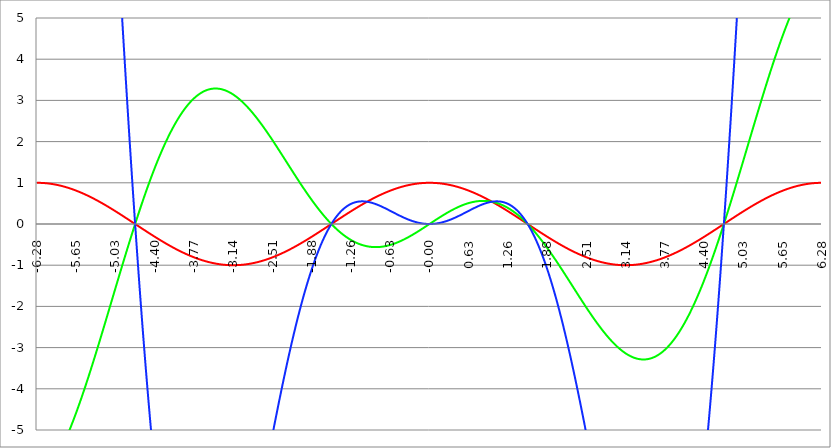
| Category | Series 1 | Series 0 | Series 2 | Series 3 | Series 4 |
|---|---|---|---|---|---|
| -6.283185307179586 | 1 | -6.283 | 39.478 |  |  |
| -6.276902121872407 | 1 | -6.277 | 39.399 |  |  |
| -6.270618936565228 | 1 | -6.27 | 39.318 |  |  |
| -6.264335751258049 | 1 | -6.263 | 39.235 |  |  |
| -6.25805256595087 | 1 | -6.256 | 39.151 |  |  |
| -6.25176938064369 | 1 | -6.249 | 39.065 |  |  |
| -6.245486195336511 | 0.999 | -6.241 | 38.978 |  |  |
| -6.23920301002933 | 0.999 | -6.233 | 38.89 |  |  |
| -6.232919824722153 | 0.999 | -6.225 | 38.8 |  |  |
| -6.226636639414973 | 0.998 | -6.217 | 38.709 |  |  |
| -6.220353454107794 | 0.998 | -6.208 | 38.616 |  |  |
| -6.214070268800615 | 0.998 | -6.199 | 38.522 |  |  |
| -6.207787083493435 | 0.997 | -6.19 | 38.427 |  |  |
| -6.201503898186257 | 0.997 | -6.181 | 38.33 |  |  |
| -6.195220712879077 | 0.996 | -6.171 | 38.232 |  |  |
| -6.188937527571898 | 0.996 | -6.161 | 38.133 |  |  |
| -6.182654342264719 | 0.995 | -6.151 | 38.032 |  |  |
| -6.17637115695754 | 0.994 | -6.141 | 37.93 |  |  |
| -6.170087971650361 | 0.994 | -6.131 | 37.827 |  |  |
| -6.163804786343182 | 0.993 | -6.12 | 37.722 |  |  |
| -6.157521601036002 | 0.992 | -6.109 | 37.616 |  |  |
| -6.151238415728823 | 0.991 | -6.098 | 37.509 |  |  |
| -6.144955230421644 | 0.99 | -6.086 | 37.4 |  |  |
| -6.138672045114464 | 0.99 | -6.075 | 37.29 |  |  |
| -6.132388859807286 | 0.989 | -6.063 | 37.179 |  |  |
| -6.126105674500106 | 0.988 | -6.051 | 37.067 |  |  |
| -6.119822489192927 | 0.987 | -6.038 | 36.954 |  |  |
| -6.113539303885748 | 0.986 | -6.026 | 36.839 |  |  |
| -6.107256118578569 | 0.985 | -6.013 | 36.723 |  |  |
| -6.10097293327139 | 0.983 | -6 | 36.606 |  |  |
| -6.09468974796421 | 0.982 | -5.987 | 36.487 |  |  |
| -6.088406562657031 | 0.981 | -5.973 | 36.368 |  |  |
| -6.082123377349852 | 0.98 | -5.96 | 36.247 |  |  |
| -6.075840192042672 | 0.979 | -5.946 | 36.125 |  |  |
| -6.069557006735494 | 0.977 | -5.932 | 36.002 |  |  |
| -6.063273821428314 | 0.976 | -5.917 | 35.878 |  |  |
| -6.056990636121135 | 0.975 | -5.903 | 35.753 |  |  |
| -6.050707450813956 | 0.973 | -5.888 | 35.626 |  |  |
| -6.044424265506777 | 0.972 | -5.873 | 35.499 |  |  |
| -6.038141080199597 | 0.97 | -5.858 | 35.37 |  |  |
| -6.031857894892418 | 0.969 | -5.842 | 35.24 |  |  |
| -6.025574709585239 | 0.967 | -5.827 | 35.109 |  |  |
| -6.01929152427806 | 0.965 | -5.811 | 34.978 |  |  |
| -6.013008338970881 | 0.964 | -5.795 | 34.845 |  |  |
| -6.006725153663701 | 0.962 | -5.779 | 34.711 |  |  |
| -6.000441968356522 | 0.96 | -5.762 | 34.576 |  |  |
| -5.994158783049343 | 0.959 | -5.746 | 34.44 |  |  |
| -5.987875597742164 | 0.957 | -5.729 | 34.303 |  |  |
| -5.981592412434984 | 0.955 | -5.712 | 34.165 |  |  |
| -5.975309227127805 | 0.953 | -5.694 | 34.025 |  |  |
| -5.969026041820626 | 0.951 | -5.677 | 33.885 |  |  |
| -5.962742856513447 | 0.949 | -5.659 | 33.744 |  |  |
| -5.956459671206268 | 0.947 | -5.641 | 33.602 |  |  |
| -5.950176485899088 | 0.945 | -5.623 | 33.46 |  |  |
| -5.94389330059191 | 0.943 | -5.605 | 33.316 |  |  |
| -5.93761011528473 | 0.941 | -5.587 | 33.171 |  |  |
| -5.931326929977551 | 0.939 | -5.568 | 33.025 |  |  |
| -5.925043744670372 | 0.937 | -5.549 | 32.879 |  |  |
| -5.918760559363193 | 0.934 | -5.53 | 32.731 |  |  |
| -5.912477374056014 | 0.932 | -5.511 | 32.583 |  |  |
| -5.906194188748834 | 0.93 | -5.491 | 32.434 |  |  |
| -5.899911003441655 | 0.927 | -5.472 | 32.283 |  |  |
| -5.893627818134476 | 0.925 | -5.452 | 32.132 |  |  |
| -5.887344632827297 | 0.923 | -5.432 | 31.981 |  |  |
| -5.881061447520117 | 0.92 | -5.412 | 31.828 |  |  |
| -5.874778262212938 | 0.918 | -5.392 | 31.674 |  |  |
| -5.868495076905759 | 0.915 | -5.371 | 31.52 |  |  |
| -5.86221189159858 | 0.913 | -5.35 | 31.365 |  |  |
| -5.855928706291401 | 0.91 | -5.33 | 31.209 |  |  |
| -5.849645520984221 | 0.907 | -5.308 | 31.053 |  |  |
| -5.843362335677042 | 0.905 | -5.287 | 30.895 |  |  |
| -5.837079150369863 | 0.902 | -5.266 | 30.737 |  |  |
| -5.830795965062684 | 0.899 | -5.244 | 30.578 |  |  |
| -5.824512779755505 | 0.897 | -5.222 | 30.419 |  |  |
| -5.818229594448325 | 0.894 | -5.201 | 30.258 |  |  |
| -5.811946409141146 | 0.891 | -5.178 | 30.097 |  |  |
| -5.805663223833967 | 0.888 | -5.156 | 29.935 |  |  |
| -5.799380038526788 | 0.885 | -5.134 | 29.773 |  |  |
| -5.793096853219609 | 0.882 | -5.111 | 29.61 |  |  |
| -5.78681366791243 | 0.879 | -5.088 | 29.446 |  |  |
| -5.780530482605251 | 0.876 | -5.066 | 29.281 |  |  |
| -5.774247297298071 | 0.873 | -5.042 | 29.116 |  |  |
| -5.767964111990892 | 0.87 | -5.019 | 28.951 |  |  |
| -5.761680926683713 | 0.867 | -4.996 | 28.784 |  |  |
| -5.755397741376534 | 0.864 | -4.972 | 28.617 |  |  |
| -5.749114556069355 | 0.861 | -4.949 | 28.45 |  |  |
| -5.742831370762175 | 0.858 | -4.925 | 28.281 |  |  |
| -5.736548185454996 | 0.854 | -4.901 | 28.113 |  |  |
| -5.730265000147816 | 0.851 | -4.876 | 27.943 |  |  |
| -5.723981814840638 | 0.848 | -4.852 | 27.773 |  |  |
| -5.717698629533459 | 0.844 | -4.828 | 27.603 |  |  |
| -5.711415444226279 | 0.841 | -4.803 | 27.432 |  |  |
| -5.7051322589191 | 0.838 | -4.778 | 27.26 |  |  |
| -5.698849073611921 | 0.834 | -4.753 | 27.088 |  |  |
| -5.692565888304742 | 0.831 | -4.728 | 26.916 |  |  |
| -5.686282702997562 | 0.827 | -4.703 | 26.743 |  |  |
| -5.679999517690383 | 0.824 | -4.678 | 26.569 |  |  |
| -5.673716332383204 | 0.82 | -4.652 | 26.395 |  |  |
| -5.667433147076025 | 0.816 | -4.627 | 26.221 |  |  |
| -5.661149961768846 | 0.813 | -4.601 | 26.046 |  |  |
| -5.654866776461667 | 0.809 | -4.575 | 25.87 |  |  |
| -5.648583591154487 | 0.805 | -4.549 | 25.695 |  |  |
| -5.642300405847308 | 0.802 | -4.523 | 25.518 |  |  |
| -5.63601722054013 | 0.798 | -4.496 | 25.342 |  |  |
| -5.62973403523295 | 0.794 | -4.47 | 25.165 |  |  |
| -5.623450849925771 | 0.79 | -4.443 | 24.987 |  |  |
| -5.617167664618591 | 0.786 | -4.417 | 24.809 |  |  |
| -5.610884479311412 | 0.782 | -4.39 | 24.631 |  |  |
| -5.604601294004233 | 0.778 | -4.363 | 24.453 |  |  |
| -5.598318108697054 | 0.775 | -4.336 | 24.274 |  |  |
| -5.592034923389875 | 0.771 | -4.309 | 24.095 |  |  |
| -5.585751738082695 | 0.766 | -4.281 | 23.915 |  |  |
| -5.579468552775516 | 0.762 | -4.254 | 23.735 |  |  |
| -5.573185367468337 | 0.758 | -4.226 | 23.555 |  |  |
| -5.566902182161157 | 0.754 | -4.199 | 23.375 |  |  |
| -5.560618996853979 | 0.75 | -4.171 | 23.194 |  |  |
| -5.5543358115468 | 0.746 | -4.143 | 23.013 |  |  |
| -5.54805262623962 | 0.742 | -4.115 | 22.831 |  |  |
| -5.54176944093244 | 0.738 | -4.087 | 22.65 |  |  |
| -5.535486255625262 | 0.733 | -4.059 | 22.468 |  |  |
| -5.529203070318083 | 0.729 | -4.031 | 22.286 |  |  |
| -5.522919885010904 | 0.725 | -4.002 | 22.104 |  |  |
| -5.516636699703724 | 0.72 | -3.974 | 21.921 |  |  |
| -5.510353514396545 | 0.716 | -3.945 | 21.739 |  |  |
| -5.504070329089366 | 0.712 | -3.916 | 21.556 |  |  |
| -5.497787143782186 | 0.707 | -3.888 | 21.373 |  |  |
| -5.491503958475008 | 0.703 | -3.859 | 21.19 |  |  |
| -5.485220773167828 | 0.698 | -3.83 | 21.006 |  |  |
| -5.47893758786065 | 0.694 | -3.8 | 20.823 |  |  |
| -5.47265440255347 | 0.689 | -3.771 | 20.639 |  |  |
| -5.466371217246291 | 0.685 | -3.742 | 20.455 |  |  |
| -5.460088031939112 | 0.68 | -3.713 | 20.271 |  |  |
| -5.453804846631932 | 0.675 | -3.683 | 20.087 |  |  |
| -5.447521661324753 | 0.671 | -3.654 | 19.903 |  |  |
| -5.441238476017574 | 0.666 | -3.624 | 19.719 |  |  |
| -5.434955290710395 | 0.661 | -3.594 | 19.534 |  |  |
| -5.428672105403215 | 0.657 | -3.564 | 19.35 |  |  |
| -5.422388920096036 | 0.652 | -3.534 | 19.165 |  |  |
| -5.416105734788857 | 0.647 | -3.505 | 18.981 |  |  |
| -5.409822549481678 | 0.642 | -3.474 | 18.796 |  |  |
| -5.403539364174499 | 0.637 | -3.444 | 18.612 |  |  |
| -5.39725617886732 | 0.633 | -3.414 | 18.427 |  |  |
| -5.39097299356014 | 0.628 | -3.384 | 18.242 |  |  |
| -5.384689808252961 | 0.623 | -3.354 | 18.058 |  |  |
| -5.378406622945782 | 0.618 | -3.323 | 17.873 |  |  |
| -5.372123437638603 | 0.613 | -3.293 | 17.688 |  |  |
| -5.365840252331424 | 0.608 | -3.262 | 17.504 |  |  |
| -5.359557067024244 | 0.603 | -3.231 | 17.319 |  |  |
| -5.353273881717065 | 0.598 | -3.201 | 17.134 |  |  |
| -5.346990696409886 | 0.593 | -3.17 | 16.95 |  |  |
| -5.340707511102707 | 0.588 | -3.139 | 16.765 |  |  |
| -5.334424325795528 | 0.583 | -3.108 | 16.581 |  |  |
| -5.328141140488348 | 0.578 | -3.077 | 16.397 |  |  |
| -5.32185795518117 | 0.572 | -3.046 | 16.213 |  |  |
| -5.31557476987399 | 0.567 | -3.015 | 16.028 |  |  |
| -5.30929158456681 | 0.562 | -2.984 | 15.844 |  |  |
| -5.303008399259631 | 0.557 | -2.953 | 15.66 |  |  |
| -5.296725213952453 | 0.552 | -2.922 | 15.477 |  |  |
| -5.290442028645273 | 0.546 | -2.891 | 15.293 |  |  |
| -5.284158843338094 | 0.541 | -2.859 | 15.109 |  |  |
| -5.277875658030915 | 0.536 | -2.828 | 14.926 |  |  |
| -5.271592472723735 | 0.531 | -2.797 | 14.743 |  |  |
| -5.265309287416557 | 0.525 | -2.765 | 14.56 |  |  |
| -5.259026102109377 | 0.52 | -2.734 | 14.377 |  |  |
| -5.252742916802198 | 0.514 | -2.702 | 14.194 |  |  |
| -5.246459731495019 | 0.509 | -2.671 | 14.012 |  |  |
| -5.24017654618784 | 0.504 | -2.639 | 13.829 |  |  |
| -5.23389336088066 | 0.498 | -2.607 | 13.647 |  |  |
| -5.227610175573481 | 0.493 | -2.576 | 13.465 |  |  |
| -5.221326990266302 | 0.487 | -2.544 | 13.284 |  |  |
| -5.215043804959122 | 0.482 | -2.512 | 13.102 |  |  |
| -5.208760619651944 | 0.476 | -2.481 | 12.921 |  |  |
| -5.202477434344764 | 0.471 | -2.449 | 12.74 |  |  |
| -5.196194249037585 | 0.465 | -2.417 | 12.559 |  |  |
| -5.189911063730406 | 0.46 | -2.385 | 12.379 |  |  |
| -5.183627878423227 | 0.454 | -2.353 | 12.199 |  |  |
| -5.177344693116048 | 0.448 | -2.321 | 12.019 |  |  |
| -5.171061507808868 | 0.443 | -2.29 | 11.839 |  |  |
| -5.164778322501689 | 0.437 | -2.258 | 11.66 |  |  |
| -5.15849513719451 | 0.431 | -2.226 | 11.481 |  |  |
| -5.152211951887331 | 0.426 | -2.194 | 11.302 |  |  |
| -5.145928766580152 | 0.42 | -2.162 | 11.124 |  |  |
| -5.139645581272972 | 0.414 | -2.13 | 10.946 |  |  |
| -5.133362395965793 | 0.409 | -2.098 | 10.768 |  |  |
| -5.127079210658614 | 0.403 | -2.066 | 10.591 |  |  |
| -5.120796025351435 | 0.397 | -2.034 | 10.414 |  |  |
| -5.114512840044256 | 0.391 | -2.002 | 10.238 |  |  |
| -5.108229654737076 | 0.386 | -1.97 | 10.061 |  |  |
| -5.101946469429897 | 0.38 | -1.938 | 9.886 |  |  |
| -5.095663284122718 | 0.374 | -1.906 | 9.71 |  |  |
| -5.08938009881554 | 0.368 | -1.874 | 9.535 |  |  |
| -5.08309691350836 | 0.362 | -1.841 | 9.36 |  |  |
| -5.07681372820118 | 0.356 | -1.809 | 9.186 |  |  |
| -5.070530542894002 | 0.351 | -1.777 | 9.012 |  |  |
| -5.064247357586822 | 0.345 | -1.745 | 8.839 |  |  |
| -5.057964172279643 | 0.339 | -1.713 | 8.666 |  |  |
| -5.051680986972464 | 0.333 | -1.681 | 8.493 |  |  |
| -5.045397801665285 | 0.327 | -1.649 | 8.321 |  |  |
| -5.039114616358106 | 0.321 | -1.617 | 8.15 |  |  |
| -5.032831431050926 | 0.315 | -1.585 | 7.978 |  |  |
| -5.026548245743747 | 0.309 | -1.553 | 7.808 |  |  |
| -5.020265060436568 | 0.303 | -1.521 | 7.637 |  |  |
| -5.013981875129389 | 0.297 | -1.489 | 7.468 |  |  |
| -5.00769868982221 | 0.291 | -1.457 | 7.298 |  |  |
| -5.00141550451503 | 0.285 | -1.425 | 7.13 |  |  |
| -4.995132319207851 | 0.279 | -1.394 | 6.961 |  |  |
| -4.98884913390067 | 0.273 | -1.362 | 6.793 |  |  |
| -4.982565948593493 | 0.267 | -1.33 | 6.626 |  |  |
| -4.976282763286313 | 0.261 | -1.298 | 6.459 |  |  |
| -4.969999577979134 | 0.255 | -1.266 | 6.293 |  |  |
| -4.963716392671955 | 0.249 | -1.234 | 6.127 |  |  |
| -4.957433207364776 | 0.243 | -1.203 | 5.962 |  |  |
| -4.951150022057597 | 0.236 | -1.171 | 5.798 |  |  |
| -4.944866836750418 | 0.23 | -1.139 | 5.633 |  |  |
| -4.938583651443238 | 0.224 | -1.108 | 5.47 |  |  |
| -4.932300466136059 | 0.218 | -1.076 | 5.307 |  |  |
| -4.92601728082888 | 0.212 | -1.044 | 5.144 |  |  |
| -4.9197340955217 | 0.206 | -1.013 | 4.983 |  |  |
| -4.913450910214521 | 0.2 | -0.981 | 4.821 |  |  |
| -4.907167724907342 | 0.194 | -0.95 | 4.661 |  |  |
| -4.900884539600163 | 0.187 | -0.918 | 4.501 |  |  |
| -4.894601354292984 | 0.181 | -0.887 | 4.341 |  |  |
| -4.888318168985805 | 0.175 | -0.856 | 4.182 |  |  |
| -4.882034983678625 | 0.169 | -0.824 | 4.024 |  |  |
| -4.875751798371446 | 0.163 | -0.793 | 3.866 |  |  |
| -4.869468613064267 | 0.156 | -0.762 | 3.709 |  |  |
| -4.863185427757088 | 0.15 | -0.731 | 3.553 |  |  |
| -4.856902242449909 | 0.144 | -0.699 | 3.397 |  |  |
| -4.85061905714273 | 0.138 | -0.668 | 3.242 |  |  |
| -4.84433587183555 | 0.132 | -0.637 | 3.087 |  |  |
| -4.838052686528371 | 0.125 | -0.606 | 2.934 |  |  |
| -4.831769501221192 | 0.119 | -0.575 | 2.78 |  |  |
| -4.825486315914013 | 0.113 | -0.545 | 2.628 |  |  |
| -4.819203130606833 | 0.107 | -0.514 | 2.476 |  |  |
| -4.812919945299654 | 0.1 | -0.483 | 2.325 |  |  |
| -4.806636759992475 | 0.094 | -0.452 | 2.174 |  |  |
| -4.800353574685296 | 0.088 | -0.422 | 2.024 |  |  |
| -4.794070389378117 | 0.082 | -0.391 | 1.875 |  |  |
| -4.787787204070938 | 0.075 | -0.361 | 1.727 |  |  |
| -4.781504018763758 | 0.069 | -0.33 | 1.579 |  |  |
| -4.77522083345658 | 0.063 | -0.3 | 1.432 |  |  |
| -4.7689376481494 | 0.057 | -0.27 | 1.285 |  |  |
| -4.762654462842221 | 0.05 | -0.239 | 1.14 |  |  |
| -4.756371277535042 | 0.044 | -0.209 | 0.995 |  |  |
| -4.750088092227862 | 0.038 | -0.179 | 0.85 |  |  |
| -4.743804906920683 | 0.031 | -0.149 | 0.707 |  |  |
| -4.737521721613504 | 0.025 | -0.119 | 0.564 |  |  |
| -4.731238536306324 | 0.019 | -0.089 | 0.422 |  |  |
| -4.724955350999146 | 0.013 | -0.059 | 0.281 |  |  |
| -4.718672165691966 | 0.006 | -0.03 | 0.14 |  |  |
| -4.712388980384787 | 0 | 0 | 0 |  |  |
| -4.706105795077608 | -0.006 | 0.03 | -0.139 |  |  |
| -4.699822609770429 | -0.013 | 0.059 | -0.278 |  |  |
| -4.69353942446325 | -0.019 | 0.088 | -0.415 |  |  |
| -4.68725623915607 | -0.025 | 0.118 | -0.552 |  |  |
| -4.680973053848891 | -0.031 | 0.147 | -0.688 |  |  |
| -4.674689868541712 | -0.038 | 0.176 | -0.824 |  |  |
| -4.668406683234533 | -0.044 | 0.205 | -0.958 |  |  |
| -4.662123497927354 | -0.05 | 0.234 | -1.092 |  |  |
| -4.655840312620174 | -0.057 | 0.263 | -1.225 |  |  |
| -4.649557127312995 | -0.063 | 0.292 | -1.357 |  |  |
| -4.643273942005816 | -0.069 | 0.321 | -1.489 |  |  |
| -4.636990756698637 | -0.075 | 0.349 | -1.62 |  |  |
| -4.630707571391458 | -0.082 | 0.378 | -1.75 |  |  |
| -4.624424386084279 | -0.088 | 0.406 | -1.879 |  |  |
| -4.618141200777099 | -0.094 | 0.435 | -2.007 |  |  |
| -4.61185801546992 | -0.1 | 0.463 | -2.135 |  |  |
| -4.605574830162741 | -0.107 | 0.491 | -2.261 |  |  |
| -4.599291644855561 | -0.113 | 0.519 | -2.387 |  |  |
| -4.593008459548383 | -0.119 | 0.547 | -2.512 |  |  |
| -4.586725274241203 | -0.125 | 0.575 | -2.637 |  |  |
| -4.580442088934024 | -0.132 | 0.603 | -2.76 |  |  |
| -4.574158903626845 | -0.138 | 0.63 | -2.883 |  |  |
| -4.567875718319666 | -0.144 | 0.658 | -3.005 |  |  |
| -4.561592533012487 | -0.15 | 0.685 | -3.126 |  |  |
| -4.555309347705307 | -0.156 | 0.713 | -3.246 |  |  |
| -4.549026162398128 | -0.163 | 0.74 | -3.366 |  |  |
| -4.542742977090949 | -0.169 | 0.767 | -3.484 |  |  |
| -4.53645979178377 | -0.175 | 0.794 | -3.602 |  |  |
| -4.530176606476591 | -0.181 | 0.821 | -3.719 |  |  |
| -4.523893421169412 | -0.187 | 0.848 | -3.835 |  |  |
| -4.517610235862232 | -0.194 | 0.874 | -3.95 |  |  |
| -4.511327050555053 | -0.2 | 0.901 | -4.065 |  |  |
| -4.505043865247874 | -0.206 | 0.927 | -4.178 |  |  |
| -4.498760679940694 | -0.212 | 0.954 | -4.291 |  |  |
| -4.492477494633515 | -0.218 | 0.98 | -4.403 |  |  |
| -4.486194309326336 | -0.224 | 1.006 | -4.514 |  |  |
| -4.479911124019157 | -0.23 | 1.032 | -4.624 |  |  |
| -4.473627938711977 | -0.236 | 1.058 | -4.733 |  |  |
| -4.467344753404799 | -0.243 | 1.084 | -4.842 |  |  |
| -4.46106156809762 | -0.249 | 1.109 | -4.949 |  |  |
| -4.45477838279044 | -0.255 | 1.135 | -5.056 |  |  |
| -4.44849519748326 | -0.261 | 1.16 | -5.162 |  |  |
| -4.442212012176082 | -0.267 | 1.186 | -5.267 |  |  |
| -4.435928826868903 | -0.273 | 1.211 | -5.371 |  |  |
| -4.429645641561723 | -0.279 | 1.236 | -5.474 |  |  |
| -4.423362456254544 | -0.285 | 1.261 | -5.577 |  |  |
| -4.417079270947365 | -0.291 | 1.286 | -5.678 |  |  |
| -4.410796085640185 | -0.297 | 1.31 | -5.779 |  |  |
| -4.404512900333007 | -0.303 | 1.335 | -5.879 |  |  |
| -4.398229715025827 | -0.309 | 1.359 | -5.978 |  |  |
| -4.391946529718648 | -0.315 | 1.383 | -6.076 |  |  |
| -4.38566334441147 | -0.321 | 1.408 | -6.173 |  |  |
| -4.37938015910429 | -0.327 | 1.432 | -6.269 |  |  |
| -4.373096973797111 | -0.333 | 1.455 | -6.365 |  |  |
| -4.366813788489932 | -0.339 | 1.479 | -6.459 |  |  |
| -4.360530603182752 | -0.345 | 1.503 | -6.553 |  |  |
| -4.354247417875573 | -0.351 | 1.526 | -6.646 |  |  |
| -4.347964232568394 | -0.356 | 1.55 | -6.738 |  |  |
| -4.341681047261215 | -0.362 | 1.573 | -6.829 |  |  |
| -4.335397861954035 | -0.368 | 1.596 | -6.919 |  |  |
| -4.329114676646856 | -0.374 | 1.619 | -7.008 |  |  |
| -4.322831491339677 | -0.38 | 1.642 | -7.097 |  |  |
| -4.316548306032498 | -0.386 | 1.664 | -7.184 |  |  |
| -4.310265120725319 | -0.391 | 1.687 | -7.271 |  |  |
| -4.30398193541814 | -0.397 | 1.709 | -7.357 |  |  |
| -4.29769875011096 | -0.403 | 1.732 | -7.442 |  |  |
| -4.291415564803781 | -0.409 | 1.754 | -7.526 |  |  |
| -4.285132379496602 | -0.414 | 1.776 | -7.609 |  |  |
| -4.278849194189422 | -0.42 | 1.797 | -7.691 |  |  |
| -4.272566008882244 | -0.426 | 1.819 | -7.773 |  |  |
| -4.266282823575064 | -0.431 | 1.841 | -7.853 |  |  |
| -4.259999638267885 | -0.437 | 1.862 | -7.933 |  |  |
| -4.253716452960706 | -0.443 | 1.883 | -8.011 |  |  |
| -4.247433267653527 | -0.448 | 1.904 | -8.089 |  |  |
| -4.241150082346347 | -0.454 | 1.925 | -8.166 |  |  |
| -4.234866897039168 | -0.46 | 1.946 | -8.242 |  |  |
| -4.228583711731989 | -0.465 | 1.967 | -8.317 |  |  |
| -4.22230052642481 | -0.471 | 1.987 | -8.392 |  |  |
| -4.216017341117631 | -0.476 | 2.008 | -8.465 |  |  |
| -4.209734155810452 | -0.482 | 2.028 | -8.538 |  |  |
| -4.203450970503273 | -0.487 | 2.048 | -8.609 |  |  |
| -4.197167785196093 | -0.493 | 2.068 | -8.68 |  |  |
| -4.190884599888914 | -0.498 | 2.088 | -8.75 |  |  |
| -4.184601414581734 | -0.504 | 2.107 | -8.819 |  |  |
| -4.178318229274556 | -0.509 | 2.127 | -8.887 |  |  |
| -4.172035043967377 | -0.514 | 2.146 | -8.954 |  |  |
| -4.165751858660197 | -0.52 | 2.165 | -9.021 |  |  |
| -4.159468673353018 | -0.525 | 2.184 | -9.086 |  |  |
| -4.153185488045839 | -0.531 | 2.203 | -9.151 |  |  |
| -4.14690230273866 | -0.536 | 2.222 | -9.215 |  |  |
| -4.140619117431481 | -0.541 | 2.241 | -9.277 |  |  |
| -4.134335932124301 | -0.546 | 2.259 | -9.339 |  |  |
| -4.128052746817122 | -0.552 | 2.277 | -9.4 |  |  |
| -4.121769561509943 | -0.557 | 2.295 | -9.461 |  |  |
| -4.115486376202764 | -0.562 | 2.313 | -9.52 |  |  |
| -4.109203190895584 | -0.567 | 2.331 | -9.579 |  |  |
| -4.102920005588405 | -0.572 | 2.349 | -9.636 |  |  |
| -4.096636820281226 | -0.578 | 2.366 | -9.693 |  |  |
| -4.090353634974047 | -0.583 | 2.383 | -9.749 |  |  |
| -4.084070449666868 | -0.588 | 2.401 | -9.804 |  |  |
| -4.077787264359689 | -0.593 | 2.418 | -9.858 |  |  |
| -4.071504079052509 | -0.598 | 2.434 | -9.912 |  |  |
| -4.06522089374533 | -0.603 | 2.451 | -9.964 |  |  |
| -4.058937708438151 | -0.608 | 2.468 | -10.016 |  |  |
| -4.052654523130972 | -0.613 | 2.484 | -10.066 |  |  |
| -4.046371337823793 | -0.618 | 2.5 | -10.116 |  |  |
| -4.040088152516613 | -0.623 | 2.516 | -10.165 |  |  |
| -4.033804967209434 | -0.628 | 2.532 | -10.214 |  |  |
| -4.027521781902255 | -0.633 | 2.548 | -10.261 |  |  |
| -4.021238596595076 | -0.637 | 2.563 | -10.307 |  |  |
| -4.014955411287897 | -0.642 | 2.579 | -10.353 |  |  |
| -4.008672225980717 | -0.647 | 2.594 | -10.398 |  |  |
| -4.002389040673538 | -0.652 | 2.609 | -10.442 |  |  |
| -3.996105855366359 | -0.657 | 2.624 | -10.485 |  |  |
| -3.989822670059179 | -0.661 | 2.639 | -10.527 |  |  |
| -3.983539484752 | -0.666 | 2.653 | -10.569 |  |  |
| -3.97725629944482 | -0.671 | 2.667 | -10.609 |  |  |
| -3.97097311413764 | -0.675 | 2.682 | -10.649 |  |  |
| -3.96468992883046 | -0.68 | 2.696 | -10.688 |  |  |
| -3.958406743523281 | -0.685 | 2.71 | -10.726 |  |  |
| -3.952123558216101 | -0.689 | 2.723 | -10.763 |  |  |
| -3.945840372908922 | -0.694 | 2.737 | -10.8 |  |  |
| -3.939557187601742 | -0.698 | 2.75 | -10.836 |  |  |
| -3.933274002294562 | -0.703 | 2.764 | -10.87 |  |  |
| -3.926990816987382 | -0.707 | 2.777 | -10.904 |  |  |
| -3.920707631680203 | -0.712 | 2.79 | -10.938 |  |  |
| -3.914424446373023 | -0.716 | 2.802 | -10.97 |  |  |
| -3.908141261065844 | -0.72 | 2.815 | -11.002 |  |  |
| -3.901858075758664 | -0.725 | 2.827 | -11.032 |  |  |
| -3.895574890451484 | -0.729 | 2.84 | -11.062 |  |  |
| -3.889291705144305 | -0.733 | 2.852 | -11.092 |  |  |
| -3.883008519837125 | -0.738 | 2.864 | -11.12 |  |  |
| -3.876725334529945 | -0.742 | 2.876 | -11.148 |  |  |
| -3.870442149222766 | -0.746 | 2.887 | -11.174 |  |  |
| -3.864158963915586 | -0.75 | 2.899 | -11.2 |  |  |
| -3.857875778608407 | -0.754 | 2.91 | -11.226 |  |  |
| -3.851592593301227 | -0.758 | 2.921 | -11.25 |  |  |
| -3.845309407994047 | -0.762 | 2.932 | -11.274 |  |  |
| -3.839026222686868 | -0.766 | 2.943 | -11.297 |  |  |
| -3.832743037379688 | -0.771 | 2.953 | -11.319 |  |  |
| -3.826459852072508 | -0.775 | 2.964 | -11.34 |  |  |
| -3.820176666765329 | -0.778 | 2.974 | -11.361 |  |  |
| -3.813893481458149 | -0.782 | 2.984 | -11.38 |  |  |
| -3.807610296150969 | -0.786 | 2.994 | -11.4 |  |  |
| -3.80132711084379 | -0.79 | 3.004 | -11.418 |  |  |
| -3.79504392553661 | -0.794 | 3.013 | -11.435 |  |  |
| -3.78876074022943 | -0.798 | 3.023 | -11.452 |  |  |
| -3.782477554922251 | -0.802 | 3.032 | -11.468 |  |  |
| -3.776194369615071 | -0.805 | 3.041 | -11.483 |  |  |
| -3.769911184307892 | -0.809 | 3.05 | -11.498 |  |  |
| -3.763627999000712 | -0.813 | 3.059 | -11.512 |  |  |
| -3.757344813693532 | -0.816 | 3.067 | -11.525 |  |  |
| -3.751061628386352 | -0.82 | 3.076 | -11.537 |  |  |
| -3.744778443079173 | -0.824 | 3.084 | -11.549 |  |  |
| -3.738495257771993 | -0.827 | 3.092 | -11.56 |  |  |
| -3.732212072464814 | -0.831 | 3.1 | -11.57 |  |  |
| -3.725928887157634 | -0.834 | 3.108 | -11.579 |  |  |
| -3.719645701850454 | -0.838 | 3.115 | -11.588 |  |  |
| -3.713362516543275 | -0.841 | 3.123 | -11.596 |  |  |
| -3.707079331236095 | -0.844 | 3.13 | -11.603 |  |  |
| -3.700796145928915 | -0.848 | 3.137 | -11.61 |  |  |
| -3.694512960621736 | -0.851 | 3.144 | -11.616 |  |  |
| -3.688229775314556 | -0.854 | 3.151 | -11.621 |  |  |
| -3.681946590007376 | -0.858 | 3.157 | -11.625 |  |  |
| -3.675663404700197 | -0.861 | 3.164 | -11.629 |  |  |
| -3.669380219393017 | -0.864 | 3.17 | -11.632 |  |  |
| -3.663097034085838 | -0.867 | 3.176 | -11.635 |  |  |
| -3.656813848778658 | -0.87 | 3.182 | -11.636 |  |  |
| -3.650530663471478 | -0.873 | 3.188 | -11.637 |  |  |
| -3.644247478164299 | -0.876 | 3.193 | -11.638 |  |  |
| -3.63796429285712 | -0.879 | 3.199 | -11.638 |  |  |
| -3.631681107549939 | -0.882 | 3.204 | -11.637 |  |  |
| -3.62539792224276 | -0.885 | 3.209 | -11.635 |  |  |
| -3.61911473693558 | -0.888 | 3.214 | -11.633 |  |  |
| -3.612831551628401 | -0.891 | 3.219 | -11.63 |  |  |
| -3.606548366321221 | -0.894 | 3.224 | -11.626 |  |  |
| -3.600265181014041 | -0.897 | 3.228 | -11.622 |  |  |
| -3.593981995706862 | -0.899 | 3.232 | -11.617 |  |  |
| -3.587698810399682 | -0.902 | 3.237 | -11.612 |  |  |
| -3.581415625092502 | -0.905 | 3.241 | -11.606 |  |  |
| -3.575132439785323 | -0.907 | 3.244 | -11.599 |  |  |
| -3.568849254478143 | -0.91 | 3.248 | -11.592 |  |  |
| -3.562566069170964 | -0.913 | 3.252 | -11.584 |  |  |
| -3.556282883863784 | -0.915 | 3.255 | -11.575 |  |  |
| -3.549999698556604 | -0.918 | 3.258 | -11.566 |  |  |
| -3.543716513249425 | -0.92 | 3.261 | -11.556 |  |  |
| -3.537433327942245 | -0.923 | 3.264 | -11.546 |  |  |
| -3.531150142635065 | -0.925 | 3.267 | -11.535 |  |  |
| -3.524866957327886 | -0.927 | 3.269 | -11.523 |  |  |
| -3.518583772020706 | -0.93 | 3.271 | -11.511 |  |  |
| -3.512300586713526 | -0.932 | 3.274 | -11.498 |  |  |
| -3.506017401406347 | -0.934 | 3.276 | -11.485 |  |  |
| -3.499734216099167 | -0.937 | 3.278 | -11.471 |  |  |
| -3.493451030791987 | -0.939 | 3.279 | -11.456 |  |  |
| -3.487167845484808 | -0.941 | 3.281 | -11.441 |  |  |
| -3.480884660177628 | -0.943 | 3.282 | -11.426 |  |  |
| -3.474601474870449 | -0.945 | 3.284 | -11.41 |  |  |
| -3.468318289563269 | -0.947 | 3.285 | -11.393 |  |  |
| -3.462035104256089 | -0.949 | 3.286 | -11.376 |  |  |
| -3.45575191894891 | -0.951 | 3.287 | -11.358 |  |  |
| -3.44946873364173 | -0.953 | 3.287 | -11.339 |  |  |
| -3.44318554833455 | -0.955 | 3.288 | -11.32 |  |  |
| -3.436902363027371 | -0.957 | 3.288 | -11.301 |  |  |
| -3.430619177720191 | -0.959 | 3.288 | -11.281 |  |  |
| -3.424335992413011 | -0.96 | 3.288 | -11.26 |  |  |
| -3.418052807105832 | -0.962 | 3.288 | -11.239 |  |  |
| -3.411769621798652 | -0.964 | 3.288 | -11.218 |  |  |
| -3.405486436491473 | -0.965 | 3.288 | -11.196 |  |  |
| -3.399203251184293 | -0.967 | 3.287 | -11.173 |  |  |
| -3.392920065877113 | -0.969 | 3.286 | -11.15 |  |  |
| -3.386636880569934 | -0.97 | 3.285 | -11.127 |  |  |
| -3.380353695262754 | -0.972 | 3.284 | -11.103 |  |  |
| -3.374070509955574 | -0.973 | 3.283 | -11.078 |  |  |
| -3.367787324648395 | -0.975 | 3.282 | -11.053 |  |  |
| -3.361504139341215 | -0.976 | 3.281 | -11.028 |  |  |
| -3.355220954034035 | -0.977 | 3.279 | -11.002 |  |  |
| -3.348937768726855 | -0.979 | 3.277 | -10.975 |  |  |
| -3.342654583419676 | -0.98 | 3.275 | -10.948 |  |  |
| -3.336371398112496 | -0.981 | 3.273 | -10.921 |  |  |
| -3.330088212805317 | -0.982 | 3.271 | -10.893 |  |  |
| -3.323805027498137 | -0.983 | 3.269 | -10.865 |  |  |
| -3.317521842190957 | -0.985 | 3.266 | -10.836 |  |  |
| -3.311238656883778 | -0.986 | 3.264 | -10.807 |  |  |
| -3.304955471576598 | -0.987 | 3.261 | -10.777 |  |  |
| -3.298672286269419 | -0.988 | 3.258 | -10.747 |  |  |
| -3.292389100962239 | -0.989 | 3.255 | -10.717 |  |  |
| -3.286105915655059 | -0.99 | 3.252 | -10.686 |  |  |
| -3.27982273034788 | -0.99 | 3.249 | -10.655 |  |  |
| -3.2735395450407 | -0.991 | 3.245 | -10.623 |  |  |
| -3.26725635973352 | -0.992 | 3.241 | -10.591 |  |  |
| -3.260973174426341 | -0.993 | 3.238 | -10.558 |  |  |
| -3.254689989119161 | -0.994 | 3.234 | -10.525 |  |  |
| -3.248406803811982 | -0.994 | 3.23 | -10.492 |  |  |
| -3.242123618504802 | -0.995 | 3.226 | -10.458 |  |  |
| -3.235840433197622 | -0.996 | 3.221 | -10.424 |  |  |
| -3.229557247890442 | -0.996 | 3.217 | -10.39 |  |  |
| -3.223274062583263 | -0.997 | 3.213 | -10.355 |  |  |
| -3.216990877276083 | -0.997 | 3.208 | -10.32 |  |  |
| -3.210707691968904 | -0.998 | 3.203 | -10.284 |  |  |
| -3.204424506661724 | -0.998 | 3.198 | -10.248 |  |  |
| -3.198141321354544 | -0.998 | 3.193 | -10.212 |  |  |
| -3.191858136047365 | -0.999 | 3.188 | -10.175 |  |  |
| -3.185574950740185 | -0.999 | 3.182 | -10.138 |  |  |
| -3.179291765433005 | -0.999 | 3.177 | -10.101 |  |  |
| -3.173008580125826 | -1 | 3.171 | -10.063 |  |  |
| -3.166725394818646 | -1 | 3.166 | -10.025 |  |  |
| -3.160442209511467 | -1 | 3.16 | -9.987 |  |  |
| -3.154159024204287 | -1 | 3.154 | -9.948 |  |  |
| -3.147875838897107 | -1 | 3.148 | -9.909 |  |  |
| -3.141592653589928 | -1 | 3.142 | -9.87 |  |  |
| -3.135309468282748 | -1 | 3.135 | -9.83 |  |  |
| -3.129026282975568 | -1 | 3.129 | -9.79 |  |  |
| -3.122743097668389 | -1 | 3.122 | -9.75 |  |  |
| -3.116459912361209 | -1 | 3.115 | -9.709 |  |  |
| -3.110176727054029 | -1 | 3.109 | -9.668 |  |  |
| -3.10389354174685 | -0.999 | 3.102 | -9.627 |  |  |
| -3.09761035643967 | -0.999 | 3.095 | -9.586 |  |  |
| -3.09132717113249 | -0.999 | 3.087 | -9.544 |  |  |
| -3.085043985825311 | -0.998 | 3.08 | -9.502 |  |  |
| -3.078760800518131 | -0.998 | 3.073 | -9.46 |  |  |
| -3.072477615210952 | -0.998 | 3.065 | -9.418 |  |  |
| -3.066194429903772 | -0.997 | 3.057 | -9.375 |  |  |
| -3.059911244596592 | -0.997 | 3.05 | -9.332 |  |  |
| -3.053628059289413 | -0.996 | 3.042 | -9.289 |  |  |
| -3.047344873982233 | -0.996 | 3.034 | -9.245 |  |  |
| -3.041061688675053 | -0.995 | 3.026 | -9.201 |  |  |
| -3.034778503367874 | -0.994 | 3.017 | -9.157 |  |  |
| -3.028495318060694 | -0.994 | 3.009 | -9.113 |  |  |
| -3.022212132753515 | -0.993 | 3.001 | -9.069 |  |  |
| -3.015928947446335 | -0.992 | 2.992 | -9.024 |  |  |
| -3.009645762139155 | -0.991 | 2.983 | -8.979 |  |  |
| -3.003362576831975 | -0.99 | 2.975 | -8.934 |  |  |
| -2.997079391524796 | -0.99 | 2.966 | -8.889 |  |  |
| -2.990796206217616 | -0.989 | 2.957 | -8.843 |  |  |
| -2.984513020910436 | -0.988 | 2.948 | -8.798 |  |  |
| -2.978229835603257 | -0.987 | 2.939 | -8.752 |  |  |
| -2.971946650296077 | -0.986 | 2.929 | -8.706 |  |  |
| -2.965663464988898 | -0.985 | 2.92 | -8.659 |  |  |
| -2.959380279681718 | -0.983 | 2.91 | -8.613 |  |  |
| -2.953097094374538 | -0.982 | 2.901 | -8.566 |  |  |
| -2.946813909067359 | -0.981 | 2.891 | -8.52 |  |  |
| -2.94053072376018 | -0.98 | 2.881 | -8.473 |  |  |
| -2.934247538453 | -0.979 | 2.871 | -8.425 |  |  |
| -2.92796435314582 | -0.977 | 2.861 | -8.378 |  |  |
| -2.92168116783864 | -0.976 | 2.851 | -8.331 |  |  |
| -2.915397982531461 | -0.975 | 2.841 | -8.283 |  |  |
| -2.909114797224281 | -0.973 | 2.831 | -8.235 |  |  |
| -2.902831611917101 | -0.972 | 2.82 | -8.187 |  |  |
| -2.896548426609922 | -0.97 | 2.81 | -8.139 |  |  |
| -2.890265241302742 | -0.969 | 2.799 | -8.091 |  |  |
| -2.883982055995562 | -0.967 | 2.789 | -8.043 |  |  |
| -2.877698870688383 | -0.965 | 2.778 | -7.994 |  |  |
| -2.871415685381203 | -0.964 | 2.767 | -7.946 |  |  |
| -2.865132500074023 | -0.962 | 2.756 | -7.897 |  |  |
| -2.858849314766844 | -0.96 | 2.745 | -7.848 |  |  |
| -2.852566129459664 | -0.959 | 2.734 | -7.8 |  |  |
| -2.846282944152485 | -0.957 | 2.723 | -7.751 |  |  |
| -2.839999758845305 | -0.955 | 2.712 | -7.702 |  |  |
| -2.833716573538125 | -0.953 | 2.7 | -7.652 |  |  |
| -2.827433388230946 | -0.951 | 2.689 | -7.603 |  |  |
| -2.821150202923766 | -0.949 | 2.678 | -7.554 |  |  |
| -2.814867017616586 | -0.947 | 2.666 | -7.504 |  |  |
| -2.808583832309407 | -0.945 | 2.654 | -7.455 |  |  |
| -2.802300647002227 | -0.943 | 2.643 | -7.405 |  |  |
| -2.796017461695047 | -0.941 | 2.631 | -7.356 |  |  |
| -2.789734276387867 | -0.939 | 2.619 | -7.306 |  |  |
| -2.783451091080688 | -0.937 | 2.607 | -7.256 |  |  |
| -2.777167905773509 | -0.934 | 2.595 | -7.206 |  |  |
| -2.770884720466329 | -0.932 | 2.583 | -7.156 |  |  |
| -2.764601535159149 | -0.93 | 2.57 | -7.106 |  |  |
| -2.75831834985197 | -0.927 | 2.558 | -7.056 |  |  |
| -2.75203516454479 | -0.925 | 2.546 | -7.006 |  |  |
| -2.74575197923761 | -0.923 | 2.533 | -6.956 |  |  |
| -2.739468793930431 | -0.92 | 2.521 | -6.906 |  |  |
| -2.733185608623251 | -0.918 | 2.508 | -6.856 |  |  |
| -2.726902423316071 | -0.915 | 2.496 | -6.806 |  |  |
| -2.720619238008892 | -0.913 | 2.483 | -6.756 |  |  |
| -2.714336052701712 | -0.91 | 2.47 | -6.705 |  |  |
| -2.708052867394532 | -0.907 | 2.458 | -6.655 |  |  |
| -2.701769682087352 | -0.905 | 2.445 | -6.605 |  |  |
| -2.695486496780173 | -0.902 | 2.432 | -6.555 |  |  |
| -2.689203311472993 | -0.899 | 2.419 | -6.504 |  |  |
| -2.682920126165814 | -0.897 | 2.406 | -6.454 |  |  |
| -2.676636940858634 | -0.894 | 2.392 | -6.404 |  |  |
| -2.670353755551454 | -0.891 | 2.379 | -6.354 |  |  |
| -2.664070570244275 | -0.888 | 2.366 | -6.303 |  |  |
| -2.657787384937095 | -0.885 | 2.353 | -6.253 |  |  |
| -2.651504199629916 | -0.882 | 2.339 | -6.203 |  |  |
| -2.645221014322736 | -0.879 | 2.326 | -6.153 |  |  |
| -2.638937829015556 | -0.876 | 2.313 | -6.103 |  |  |
| -2.632654643708377 | -0.873 | 2.299 | -6.052 |  |  |
| -2.626371458401197 | -0.87 | 2.285 | -6.002 |  |  |
| -2.620088273094018 | -0.867 | 2.272 | -5.952 |  |  |
| -2.613805087786838 | -0.864 | 2.258 | -5.902 |  |  |
| -2.607521902479658 | -0.861 | 2.244 | -5.852 |  |  |
| -2.601238717172478 | -0.858 | 2.231 | -5.802 |  |  |
| -2.594955531865299 | -0.854 | 2.217 | -5.753 |  |  |
| -2.588672346558119 | -0.851 | 2.203 | -5.703 |  |  |
| -2.58238916125094 | -0.848 | 2.189 | -5.653 |  |  |
| -2.57610597594376 | -0.844 | 2.175 | -5.603 |  |  |
| -2.56982279063658 | -0.841 | 2.161 | -5.554 |  |  |
| -2.563539605329401 | -0.838 | 2.147 | -5.504 |  |  |
| -2.557256420022221 | -0.834 | 2.133 | -5.455 |  |  |
| -2.550973234715042 | -0.831 | 2.119 | -5.405 |  |  |
| -2.544690049407862 | -0.827 | 2.105 | -5.356 |  |  |
| -2.538406864100682 | -0.824 | 2.09 | -5.306 |  |  |
| -2.532123678793503 | -0.82 | 2.076 | -5.257 |  |  |
| -2.525840493486323 | -0.816 | 2.062 | -5.208 |  |  |
| -2.519557308179143 | -0.813 | 2.048 | -5.159 |  |  |
| -2.513274122871964 | -0.809 | 2.033 | -5.11 |  |  |
| -2.506990937564784 | -0.805 | 2.019 | -5.061 |  |  |
| -2.500707752257604 | -0.802 | 2.004 | -5.013 |  |  |
| -2.494424566950425 | -0.798 | 1.99 | -4.964 |  |  |
| -2.488141381643245 | -0.794 | 1.976 | -4.915 |  |  |
| -2.481858196336065 | -0.79 | 1.961 | -4.867 |  |  |
| -2.475575011028886 | -0.786 | 1.947 | -4.819 |  |  |
| -2.469291825721706 | -0.782 | 1.932 | -4.771 |  |  |
| -2.463008640414527 | -0.778 | 1.917 | -4.722 |  |  |
| -2.456725455107347 | -0.775 | 1.903 | -4.675 |  |  |
| -2.450442269800167 | -0.771 | 1.888 | -4.627 |  |  |
| -2.444159084492988 | -0.766 | 1.873 | -4.579 |  |  |
| -2.437875899185808 | -0.762 | 1.859 | -4.531 |  |  |
| -2.431592713878628 | -0.758 | 1.844 | -4.484 |  |  |
| -2.425309528571449 | -0.754 | 1.829 | -4.437 |  |  |
| -2.419026343264269 | -0.75 | 1.815 | -4.389 |  |  |
| -2.412743157957089 | -0.746 | 1.8 | -4.342 |  |  |
| -2.40645997264991 | -0.742 | 1.785 | -4.295 |  |  |
| -2.40017678734273 | -0.738 | 1.77 | -4.249 |  |  |
| -2.393893602035551 | -0.733 | 1.755 | -4.202 |  |  |
| -2.387610416728371 | -0.729 | 1.74 | -4.156 |  |  |
| -2.381327231421191 | -0.725 | 1.726 | -4.109 |  |  |
| -2.375044046114012 | -0.72 | 1.711 | -4.063 |  |  |
| -2.368760860806832 | -0.716 | 1.696 | -4.017 |  |  |
| -2.362477675499652 | -0.712 | 1.681 | -3.971 |  |  |
| -2.356194490192473 | -0.707 | 1.666 | -3.926 |  |  |
| -2.349911304885293 | -0.703 | 1.651 | -3.88 |  |  |
| -2.343628119578113 | -0.698 | 1.636 | -3.835 |  |  |
| -2.337344934270934 | -0.694 | 1.621 | -3.79 |  |  |
| -2.331061748963754 | -0.689 | 1.606 | -3.745 |  |  |
| -2.324778563656574 | -0.685 | 1.591 | -3.7 |  |  |
| -2.318495378349395 | -0.68 | 1.576 | -3.655 |  |  |
| -2.312212193042215 | -0.675 | 1.562 | -3.611 |  |  |
| -2.305929007735036 | -0.671 | 1.547 | -3.566 |  |  |
| -2.299645822427856 | -0.666 | 1.532 | -3.522 |  |  |
| -2.293362637120676 | -0.661 | 1.517 | -3.478 |  |  |
| -2.287079451813496 | -0.657 | 1.502 | -3.434 |  |  |
| -2.280796266506317 | -0.652 | 1.487 | -3.391 |  |  |
| -2.274513081199137 | -0.647 | 1.472 | -3.347 |  |  |
| -2.268229895891957 | -0.642 | 1.457 | -3.304 |  |  |
| -2.261946710584778 | -0.637 | 1.442 | -3.261 |  |  |
| -2.255663525277598 | -0.633 | 1.427 | -3.219 |  |  |
| -2.249380339970419 | -0.628 | 1.412 | -3.176 |  |  |
| -2.24309715466324 | -0.623 | 1.397 | -3.134 |  |  |
| -2.23681396935606 | -0.618 | 1.382 | -3.091 |  |  |
| -2.23053078404888 | -0.613 | 1.367 | -3.049 |  |  |
| -2.2242475987417 | -0.608 | 1.352 | -3.008 |  |  |
| -2.217964413434521 | -0.603 | 1.337 | -2.966 |  |  |
| -2.211681228127341 | -0.598 | 1.322 | -2.925 |  |  |
| -2.205398042820161 | -0.593 | 1.307 | -2.884 |  |  |
| -2.199114857512981 | -0.588 | 1.293 | -2.843 |  |  |
| -2.192831672205802 | -0.583 | 1.278 | -2.802 |  |  |
| -2.186548486898622 | -0.578 | 1.263 | -2.761 |  |  |
| -2.180265301591443 | -0.572 | 1.248 | -2.721 |  |  |
| -2.173982116284263 | -0.567 | 1.233 | -2.681 |  |  |
| -2.167698930977084 | -0.562 | 1.218 | -2.641 |  |  |
| -2.161415745669904 | -0.557 | 1.204 | -2.602 |  |  |
| -2.155132560362724 | -0.552 | 1.189 | -2.562 |  |  |
| -2.148849375055545 | -0.546 | 1.174 | -2.523 |  |  |
| -2.142566189748365 | -0.541 | 1.159 | -2.484 |  |  |
| -2.136283004441185 | -0.536 | 1.145 | -2.445 |  |  |
| -2.129999819134006 | -0.531 | 1.13 | -2.407 |  |  |
| -2.123716633826826 | -0.525 | 1.115 | -2.369 |  |  |
| -2.117433448519646 | -0.52 | 1.101 | -2.331 |  |  |
| -2.111150263212467 | -0.514 | 1.086 | -2.293 |  |  |
| -2.104867077905287 | -0.509 | 1.071 | -2.255 |  |  |
| -2.098583892598107 | -0.504 | 1.057 | -2.218 |  |  |
| -2.092300707290928 | -0.498 | 1.042 | -2.181 |  |  |
| -2.086017521983748 | -0.493 | 1.028 | -2.144 |  |  |
| -2.079734336676569 | -0.487 | 1.013 | -2.108 |  |  |
| -2.073451151369389 | -0.482 | 0.999 | -2.071 |  |  |
| -2.06716796606221 | -0.476 | 0.984 | -2.035 |  |  |
| -2.06088478075503 | -0.471 | 0.97 | -1.999 |  |  |
| -2.05460159544785 | -0.465 | 0.956 | -1.964 |  |  |
| -2.04831841014067 | -0.46 | 0.941 | -1.928 |  |  |
| -2.042035224833491 | -0.454 | 0.927 | -1.893 |  |  |
| -2.035752039526311 | -0.448 | 0.913 | -1.858 |  |  |
| -2.029468854219131 | -0.443 | 0.899 | -1.824 |  |  |
| -2.023185668911951 | -0.437 | 0.884 | -1.789 |  |  |
| -2.016902483604772 | -0.431 | 0.87 | -1.755 |  |  |
| -2.010619298297592 | -0.426 | 0.856 | -1.721 |  |  |
| -2.004336112990412 | -0.42 | 0.842 | -1.688 |  |  |
| -1.998052927683233 | -0.414 | 0.828 | -1.654 |  |  |
| -1.991769742376054 | -0.409 | 0.814 | -1.621 |  |  |
| -1.985486557068874 | -0.403 | 0.8 | -1.588 |  |  |
| -1.979203371761694 | -0.397 | 0.786 | -1.556 |  |  |
| -1.972920186454515 | -0.391 | 0.772 | -1.523 |  |  |
| -1.966637001147335 | -0.386 | 0.758 | -1.491 |  |  |
| -1.960353815840155 | -0.38 | 0.745 | -1.459 |  |  |
| -1.954070630532976 | -0.374 | 0.731 | -1.428 |  |  |
| -1.947787445225796 | -0.368 | 0.717 | -1.397 |  |  |
| -1.941504259918616 | -0.362 | 0.703 | -1.366 |  |  |
| -1.935221074611437 | -0.356 | 0.69 | -1.335 |  |  |
| -1.928937889304257 | -0.351 | 0.676 | -1.304 |  |  |
| -1.922654703997078 | -0.345 | 0.663 | -1.274 |  |  |
| -1.916371518689898 | -0.339 | 0.649 | -1.244 |  |  |
| -1.910088333382718 | -0.333 | 0.636 | -1.214 |  |  |
| -1.903805148075539 | -0.327 | 0.622 | -1.185 |  |  |
| -1.897521962768359 | -0.321 | 0.609 | -1.156 |  |  |
| -1.891238777461179 | -0.315 | 0.596 | -1.127 |  |  |
| -1.884955592154 | -0.309 | 0.582 | -1.098 |  |  |
| -1.87867240684682 | -0.303 | 0.569 | -1.07 |  |  |
| -1.87238922153964 | -0.297 | 0.556 | -1.041 |  |  |
| -1.866106036232461 | -0.291 | 0.543 | -1.013 |  |  |
| -1.859822850925281 | -0.285 | 0.53 | -0.986 |  |  |
| -1.853539665618102 | -0.279 | 0.517 | -0.959 |  |  |
| -1.847256480310922 | -0.273 | 0.504 | -0.931 |  |  |
| -1.840973295003742 | -0.267 | 0.491 | -0.905 |  |  |
| -1.834690109696563 | -0.261 | 0.479 | -0.878 |  |  |
| -1.828406924389383 | -0.255 | 0.466 | -0.852 |  |  |
| -1.822123739082203 | -0.249 | 0.453 | -0.826 |  |  |
| -1.815840553775024 | -0.243 | 0.441 | -0.8 |  |  |
| -1.809557368467844 | -0.236 | 0.428 | -0.774 |  |  |
| -1.803274183160664 | -0.23 | 0.415 | -0.749 |  |  |
| -1.796990997853485 | -0.224 | 0.403 | -0.724 |  |  |
| -1.790707812546305 | -0.218 | 0.391 | -0.7 |  |  |
| -1.784424627239125 | -0.212 | 0.378 | -0.675 |  |  |
| -1.778141441931946 | -0.206 | 0.366 | -0.651 |  |  |
| -1.771858256624766 | -0.2 | 0.354 | -0.627 |  |  |
| -1.765575071317587 | -0.194 | 0.342 | -0.603 |  |  |
| -1.759291886010407 | -0.187 | 0.33 | -0.58 |  |  |
| -1.753008700703227 | -0.181 | 0.318 | -0.557 |  |  |
| -1.746725515396048 | -0.175 | 0.306 | -0.534 |  |  |
| -1.740442330088868 | -0.169 | 0.294 | -0.511 |  |  |
| -1.734159144781688 | -0.163 | 0.282 | -0.489 |  |  |
| -1.727875959474509 | -0.156 | 0.27 | -0.467 |  |  |
| -1.72159277416733 | -0.15 | 0.259 | -0.445 |  |  |
| -1.715309588860149 | -0.144 | 0.247 | -0.424 |  |  |
| -1.70902640355297 | -0.138 | 0.235 | -0.402 |  |  |
| -1.70274321824579 | -0.132 | 0.224 | -0.381 |  |  |
| -1.69646003293861 | -0.125 | 0.213 | -0.361 |  |  |
| -1.690176847631431 | -0.119 | 0.201 | -0.34 |  |  |
| -1.683893662324251 | -0.113 | 0.19 | -0.32 |  |  |
| -1.677610477017072 | -0.107 | 0.179 | -0.3 |  |  |
| -1.671327291709892 | -0.1 | 0.168 | -0.28 |  |  |
| -1.665044106402712 | -0.094 | 0.157 | -0.261 |  |  |
| -1.658760921095533 | -0.088 | 0.146 | -0.242 |  |  |
| -1.652477735788353 | -0.082 | 0.135 | -0.223 |  |  |
| -1.646194550481173 | -0.075 | 0.124 | -0.204 |  |  |
| -1.639911365173994 | -0.069 | 0.113 | -0.186 |  |  |
| -1.633628179866814 | -0.063 | 0.103 | -0.168 |  |  |
| -1.627344994559634 | -0.057 | 0.092 | -0.15 |  |  |
| -1.621061809252455 | -0.05 | 0.081 | -0.132 |  |  |
| -1.614778623945275 | -0.044 | 0.071 | -0.115 |  |  |
| -1.608495438638096 | -0.038 | 0.061 | -0.098 |  |  |
| -1.602212253330916 | -0.031 | 0.05 | -0.081 |  |  |
| -1.595929068023736 | -0.025 | 0.04 | -0.064 |  |  |
| -1.589645882716557 | -0.019 | 0.03 | -0.048 |  |  |
| -1.583362697409377 | -0.013 | 0.02 | -0.032 |  |  |
| -1.577079512102197 | -0.006 | 0.01 | -0.016 |  |  |
| -1.570796326795018 | 0 | 0 | 0 |  |  |
| -1.564513141487838 | 0.006 | -0.01 | 0.015 |  |  |
| -1.558229956180659 | 0.013 | -0.02 | 0.031 |  |  |
| -1.551946770873479 | 0.019 | -0.029 | 0.045 |  |  |
| -1.545663585566299 | 0.025 | -0.039 | 0.06 |  |  |
| -1.53938040025912 | 0.031 | -0.048 | 0.074 |  |  |
| -1.53309721495194 | 0.038 | -0.058 | 0.089 |  |  |
| -1.52681402964476 | 0.044 | -0.067 | 0.102 |  |  |
| -1.520530844337581 | 0.05 | -0.076 | 0.116 |  |  |
| -1.514247659030401 | 0.057 | -0.086 | 0.13 |  |  |
| -1.507964473723221 | 0.063 | -0.095 | 0.143 |  |  |
| -1.501681288416042 | 0.069 | -0.104 | 0.156 |  |  |
| -1.495398103108862 | 0.075 | -0.113 | 0.168 |  |  |
| -1.489114917801682 | 0.082 | -0.121 | 0.181 |  |  |
| -1.482831732494503 | 0.088 | -0.13 | 0.193 |  |  |
| -1.476548547187323 | 0.094 | -0.139 | 0.205 |  |  |
| -1.470265361880144 | 0.1 | -0.148 | 0.217 |  |  |
| -1.463982176572964 | 0.107 | -0.156 | 0.228 |  |  |
| -1.457698991265784 | 0.113 | -0.165 | 0.24 |  |  |
| -1.451415805958605 | 0.119 | -0.173 | 0.251 |  |  |
| -1.445132620651425 | 0.125 | -0.181 | 0.262 |  |  |
| -1.438849435344245 | 0.132 | -0.189 | 0.272 |  |  |
| -1.432566250037066 | 0.138 | -0.197 | 0.283 |  |  |
| -1.426283064729886 | 0.144 | -0.205 | 0.293 |  |  |
| -1.419999879422706 | 0.15 | -0.213 | 0.303 |  |  |
| -1.413716694115527 | 0.156 | -0.221 | 0.313 |  |  |
| -1.407433508808347 | 0.163 | -0.229 | 0.322 |  |  |
| -1.401150323501168 | 0.169 | -0.237 | 0.331 |  |  |
| -1.394867138193988 | 0.175 | -0.244 | 0.341 |  |  |
| -1.388583952886808 | 0.181 | -0.252 | 0.349 |  |  |
| -1.382300767579629 | 0.187 | -0.259 | 0.358 |  |  |
| -1.376017582272449 | 0.194 | -0.266 | 0.366 |  |  |
| -1.369734396965269 | 0.2 | -0.274 | 0.375 |  |  |
| -1.36345121165809 | 0.206 | -0.281 | 0.383 |  |  |
| -1.35716802635091 | 0.212 | -0.288 | 0.39 |  |  |
| -1.35088484104373 | 0.218 | -0.295 | 0.398 |  |  |
| -1.344601655736551 | 0.224 | -0.302 | 0.405 |  |  |
| -1.338318470429371 | 0.23 | -0.308 | 0.413 |  |  |
| -1.332035285122191 | 0.236 | -0.315 | 0.42 |  |  |
| -1.325752099815012 | 0.243 | -0.322 | 0.426 |  |  |
| -1.319468914507832 | 0.249 | -0.328 | 0.433 |  |  |
| -1.313185729200653 | 0.255 | -0.335 | 0.439 |  |  |
| -1.306902543893473 | 0.261 | -0.341 | 0.446 |  |  |
| -1.300619358586293 | 0.267 | -0.347 | 0.451 |  |  |
| -1.294336173279114 | 0.273 | -0.353 | 0.457 |  |  |
| -1.288052987971934 | 0.279 | -0.359 | 0.463 |  |  |
| -1.281769802664754 | 0.285 | -0.365 | 0.468 |  |  |
| -1.275486617357575 | 0.291 | -0.371 | 0.473 |  |  |
| -1.269203432050395 | 0.297 | -0.377 | 0.478 |  |  |
| -1.262920246743215 | 0.303 | -0.383 | 0.483 |  |  |
| -1.256637061436036 | 0.309 | -0.388 | 0.488 |  |  |
| -1.250353876128856 | 0.315 | -0.394 | 0.492 |  |  |
| -1.244070690821677 | 0.321 | -0.399 | 0.497 |  |  |
| -1.237787505514497 | 0.327 | -0.405 | 0.501 |  |  |
| -1.231504320207317 | 0.333 | -0.41 | 0.505 |  |  |
| -1.225221134900138 | 0.339 | -0.415 | 0.509 |  |  |
| -1.218937949592958 | 0.345 | -0.42 | 0.512 |  |  |
| -1.212654764285778 | 0.351 | -0.425 | 0.515 |  |  |
| -1.206371578978599 | 0.356 | -0.43 | 0.519 |  |  |
| -1.20008839367142 | 0.362 | -0.435 | 0.522 |  |  |
| -1.193805208364239 | 0.368 | -0.439 | 0.525 |  |  |
| -1.18752202305706 | 0.374 | -0.444 | 0.527 |  |  |
| -1.18123883774988 | 0.38 | -0.449 | 0.53 |  |  |
| -1.1749556524427 | 0.386 | -0.453 | 0.532 |  |  |
| -1.168672467135521 | 0.391 | -0.457 | 0.535 |  |  |
| -1.162389281828341 | 0.397 | -0.462 | 0.537 |  |  |
| -1.156106096521162 | 0.403 | -0.466 | 0.539 |  |  |
| -1.149822911213982 | 0.409 | -0.47 | 0.54 |  |  |
| -1.143539725906802 | 0.414 | -0.474 | 0.542 |  |  |
| -1.137256540599623 | 0.42 | -0.478 | 0.543 |  |  |
| -1.130973355292443 | 0.426 | -0.482 | 0.545 |  |  |
| -1.124690169985263 | 0.431 | -0.485 | 0.546 |  |  |
| -1.118406984678084 | 0.437 | -0.489 | 0.547 |  |  |
| -1.112123799370904 | 0.443 | -0.492 | 0.548 |  |  |
| -1.105840614063724 | 0.448 | -0.496 | 0.548 |  |  |
| -1.099557428756545 | 0.454 | -0.499 | 0.549 |  |  |
| -1.093274243449365 | 0.46 | -0.502 | 0.549 |  |  |
| -1.086991058142186 | 0.465 | -0.506 | 0.55 |  |  |
| -1.080707872835006 | 0.471 | -0.509 | 0.55 |  |  |
| -1.074424687527826 | 0.476 | -0.512 | 0.55 |  |  |
| -1.068141502220647 | 0.482 | -0.515 | 0.55 |  |  |
| -1.061858316913467 | 0.487 | -0.517 | 0.549 |  |  |
| -1.055575131606287 | 0.493 | -0.52 | 0.549 |  |  |
| -1.049291946299108 | 0.498 | -0.523 | 0.549 |  |  |
| -1.043008760991928 | 0.504 | -0.525 | 0.548 |  |  |
| -1.036725575684748 | 0.509 | -0.528 | 0.547 |  |  |
| -1.030442390377569 | 0.514 | -0.53 | 0.546 |  |  |
| -1.024159205070389 | 0.52 | -0.532 | 0.545 |  |  |
| -1.01787601976321 | 0.525 | -0.535 | 0.544 |  |  |
| -1.01159283445603 | 0.531 | -0.537 | 0.543 |  |  |
| -1.00530964914885 | 0.536 | -0.539 | 0.542 |  |  |
| -0.999026463841671 | 0.541 | -0.541 | 0.54 |  |  |
| -0.992743278534491 | 0.546 | -0.542 | 0.538 |  |  |
| -0.986460093227311 | 0.552 | -0.544 | 0.537 |  |  |
| -0.980176907920132 | 0.557 | -0.546 | 0.535 |  |  |
| -0.973893722612952 | 0.562 | -0.547 | 0.533 |  |  |
| -0.967610537305772 | 0.567 | -0.549 | 0.531 |  |  |
| -0.961327351998593 | 0.572 | -0.55 | 0.529 |  |  |
| -0.955044166691413 | 0.578 | -0.552 | 0.527 |  |  |
| -0.948760981384233 | 0.583 | -0.553 | 0.525 |  |  |
| -0.942477796077054 | 0.588 | -0.554 | 0.522 |  |  |
| -0.936194610769874 | 0.593 | -0.555 | 0.52 |  |  |
| -0.929911425462695 | 0.598 | -0.556 | 0.517 |  |  |
| -0.923628240155515 | 0.603 | -0.557 | 0.514 |  |  |
| -0.917345054848335 | 0.608 | -0.558 | 0.512 |  |  |
| -0.911061869541156 | 0.613 | -0.558 | 0.509 |  |  |
| -0.904778684233976 | 0.618 | -0.559 | 0.506 |  |  |
| -0.898495498926796 | 0.623 | -0.56 | 0.503 |  |  |
| -0.892212313619617 | 0.628 | -0.56 | 0.5 |  |  |
| -0.885929128312437 | 0.633 | -0.56 | 0.496 |  |  |
| -0.879645943005257 | 0.637 | -0.561 | 0.493 |  |  |
| -0.873362757698078 | 0.642 | -0.561 | 0.49 |  |  |
| -0.867079572390898 | 0.647 | -0.561 | 0.486 |  |  |
| -0.860796387083718 | 0.652 | -0.561 | 0.483 |  |  |
| -0.854513201776539 | 0.657 | -0.561 | 0.479 |  |  |
| -0.848230016469359 | 0.661 | -0.561 | 0.476 |  |  |
| -0.84194683116218 | 0.666 | -0.561 | 0.472 |  |  |
| -0.835663645855 | 0.671 | -0.56 | 0.468 |  |  |
| -0.82938046054782 | 0.675 | -0.56 | 0.465 |  |  |
| -0.823097275240641 | 0.68 | -0.56 | 0.461 |  |  |
| -0.816814089933461 | 0.685 | -0.559 | 0.457 |  |  |
| -0.810530904626281 | 0.689 | -0.559 | 0.453 |  |  |
| -0.804247719319102 | 0.694 | -0.558 | 0.449 |  |  |
| -0.797964534011922 | 0.698 | -0.557 | 0.445 |  |  |
| -0.791681348704742 | 0.703 | -0.556 | 0.44 |  |  |
| -0.785398163397563 | 0.707 | -0.555 | 0.436 |  |  |
| -0.779114978090383 | 0.712 | -0.554 | 0.432 |  |  |
| -0.772831792783204 | 0.716 | -0.553 | 0.428 |  |  |
| -0.766548607476024 | 0.72 | -0.552 | 0.423 |  |  |
| -0.760265422168844 | 0.725 | -0.551 | 0.419 |  |  |
| -0.753982236861665 | 0.729 | -0.55 | 0.414 |  |  |
| -0.747699051554485 | 0.733 | -0.548 | 0.41 |  |  |
| -0.741415866247305 | 0.738 | -0.547 | 0.405 |  |  |
| -0.735132680940126 | 0.742 | -0.545 | 0.401 |  |  |
| -0.728849495632946 | 0.746 | -0.544 | 0.396 |  |  |
| -0.722566310325766 | 0.75 | -0.542 | 0.392 |  |  |
| -0.716283125018587 | 0.754 | -0.54 | 0.387 |  |  |
| -0.709999939711407 | 0.758 | -0.538 | 0.382 |  |  |
| -0.703716754404227 | 0.762 | -0.537 | 0.378 |  |  |
| -0.697433569097048 | 0.766 | -0.535 | 0.373 |  |  |
| -0.691150383789868 | 0.771 | -0.533 | 0.368 |  |  |
| -0.684867198482689 | 0.775 | -0.53 | 0.363 |  |  |
| -0.678584013175509 | 0.778 | -0.528 | 0.358 |  |  |
| -0.672300827868329 | 0.782 | -0.526 | 0.354 |  |  |
| -0.66601764256115 | 0.786 | -0.524 | 0.349 |  |  |
| -0.65973445725397 | 0.79 | -0.521 | 0.344 |  |  |
| -0.65345127194679 | 0.794 | -0.519 | 0.339 |  |  |
| -0.647168086639611 | 0.798 | -0.516 | 0.334 |  |  |
| -0.640884901332431 | 0.802 | -0.514 | 0.329 |  |  |
| -0.634601716025251 | 0.805 | -0.511 | 0.324 |  |  |
| -0.628318530718072 | 0.809 | -0.508 | 0.319 |  |  |
| -0.622035345410892 | 0.813 | -0.506 | 0.314 |  |  |
| -0.615752160103712 | 0.816 | -0.503 | 0.31 |  |  |
| -0.609468974796533 | 0.82 | -0.5 | 0.305 |  |  |
| -0.603185789489353 | 0.824 | -0.497 | 0.3 |  |  |
| -0.596902604182174 | 0.827 | -0.494 | 0.295 |  |  |
| -0.590619418874994 | 0.831 | -0.491 | 0.29 |  |  |
| -0.584336233567814 | 0.834 | -0.487 | 0.285 |  |  |
| -0.578053048260635 | 0.838 | -0.484 | 0.28 |  |  |
| -0.571769862953455 | 0.841 | -0.481 | 0.275 |  |  |
| -0.565486677646275 | 0.844 | -0.477 | 0.27 |  |  |
| -0.559203492339096 | 0.848 | -0.474 | 0.265 |  |  |
| -0.552920307031916 | 0.851 | -0.471 | 0.26 |  |  |
| -0.546637121724737 | 0.854 | -0.467 | 0.255 |  |  |
| -0.540353936417557 | 0.858 | -0.463 | 0.25 |  |  |
| -0.534070751110377 | 0.861 | -0.46 | 0.246 |  |  |
| -0.527787565803198 | 0.864 | -0.456 | 0.241 |  |  |
| -0.521504380496018 | 0.867 | -0.452 | 0.236 |  |  |
| -0.515221195188838 | 0.87 | -0.448 | 0.231 |  |  |
| -0.508938009881659 | 0.873 | -0.444 | 0.226 |  |  |
| -0.502654824574479 | 0.876 | -0.44 | 0.221 |  |  |
| -0.496371639267299 | 0.879 | -0.436 | 0.217 |  |  |
| -0.49008845396012 | 0.882 | -0.432 | 0.212 |  |  |
| -0.48380526865294 | 0.885 | -0.428 | 0.207 |  |  |
| -0.477522083345761 | 0.888 | -0.424 | 0.203 |  |  |
| -0.471238898038581 | 0.891 | -0.42 | 0.198 |  |  |
| -0.464955712731402 | 0.894 | -0.416 | 0.193 |  |  |
| -0.458672527424222 | 0.897 | -0.411 | 0.189 |  |  |
| -0.452389342117042 | 0.899 | -0.407 | 0.184 |  |  |
| -0.446106156809863 | 0.902 | -0.402 | 0.18 |  |  |
| -0.439822971502683 | 0.905 | -0.398 | 0.175 |  |  |
| -0.433539786195504 | 0.907 | -0.393 | 0.171 |  |  |
| -0.427256600888324 | 0.91 | -0.389 | 0.166 |  |  |
| -0.420973415581144 | 0.913 | -0.384 | 0.162 |  |  |
| -0.414690230273965 | 0.915 | -0.38 | 0.157 |  |  |
| -0.408407044966785 | 0.918 | -0.375 | 0.153 |  |  |
| -0.402123859659606 | 0.92 | -0.37 | 0.149 |  |  |
| -0.395840674352426 | 0.923 | -0.365 | 0.145 |  |  |
| -0.389557489045247 | 0.925 | -0.36 | 0.14 |  |  |
| -0.383274303738067 | 0.927 | -0.355 | 0.136 |  |  |
| -0.376991118430887 | 0.93 | -0.351 | 0.132 |  |  |
| -0.370707933123708 | 0.932 | -0.346 | 0.128 |  |  |
| -0.364424747816528 | 0.934 | -0.34 | 0.124 |  |  |
| -0.358141562509349 | 0.937 | -0.335 | 0.12 |  |  |
| -0.351858377202169 | 0.939 | -0.33 | 0.116 |  |  |
| -0.345575191894989 | 0.941 | -0.325 | 0.112 |  |  |
| -0.33929200658781 | 0.943 | -0.32 | 0.109 |  |  |
| -0.33300882128063 | 0.945 | -0.315 | 0.105 |  |  |
| -0.326725635973451 | 0.947 | -0.309 | 0.101 |  |  |
| -0.320442450666271 | 0.949 | -0.304 | 0.097 |  |  |
| -0.314159265359092 | 0.951 | -0.299 | 0.094 |  |  |
| -0.307876080051912 | 0.953 | -0.293 | 0.09 |  |  |
| -0.301592894744732 | 0.955 | -0.288 | 0.087 |  |  |
| -0.295309709437553 | 0.957 | -0.283 | 0.083 |  |  |
| -0.289026524130373 | 0.959 | -0.277 | 0.08 |  |  |
| -0.282743338823194 | 0.96 | -0.272 | 0.077 |  |  |
| -0.276460153516014 | 0.962 | -0.266 | 0.074 |  |  |
| -0.270176968208834 | 0.964 | -0.26 | 0.07 |  |  |
| -0.263893782901655 | 0.965 | -0.255 | 0.067 |  |  |
| -0.257610597594475 | 0.967 | -0.249 | 0.064 |  |  |
| -0.251327412287296 | 0.969 | -0.243 | 0.061 |  |  |
| -0.245044226980116 | 0.97 | -0.238 | 0.058 |  |  |
| -0.238761041672937 | 0.972 | -0.232 | 0.055 |  |  |
| -0.232477856365757 | 0.973 | -0.226 | 0.053 |  |  |
| -0.226194671058577 | 0.975 | -0.22 | 0.05 |  |  |
| -0.219911485751398 | 0.976 | -0.215 | 0.047 |  |  |
| -0.213628300444218 | 0.977 | -0.209 | 0.045 |  |  |
| -0.207345115137039 | 0.979 | -0.203 | 0.042 |  |  |
| -0.201061929829859 | 0.98 | -0.197 | 0.04 |  |  |
| -0.194778744522679 | 0.981 | -0.191 | 0.037 |  |  |
| -0.1884955592155 | 0.982 | -0.185 | 0.035 |  |  |
| -0.18221237390832 | 0.983 | -0.179 | 0.033 |  |  |
| -0.175929188601141 | 0.985 | -0.173 | 0.03 |  |  |
| -0.169646003293961 | 0.986 | -0.167 | 0.028 |  |  |
| -0.163362817986782 | 0.987 | -0.161 | 0.026 |  |  |
| -0.157079632679602 | 0.988 | -0.155 | 0.024 |  |  |
| -0.150796447372422 | 0.989 | -0.149 | 0.022 |  |  |
| -0.144513262065243 | 0.99 | -0.143 | 0.021 |  |  |
| -0.138230076758063 | 0.99 | -0.137 | 0.019 |  |  |
| -0.131946891450884 | 0.991 | -0.131 | 0.017 |  |  |
| -0.125663706143704 | 0.992 | -0.125 | 0.016 |  |  |
| -0.119380520836524 | 0.993 | -0.119 | 0.014 |  |  |
| -0.113097335529345 | 0.994 | -0.112 | 0.013 |  |  |
| -0.106814150222165 | 0.994 | -0.106 | 0.011 |  |  |
| -0.100530964914986 | 0.995 | -0.1 | 0.01 |  |  |
| -0.0942477796078061 | 0.996 | -0.094 | 0.009 |  |  |
| -0.0879645943006265 | 0.996 | -0.088 | 0.008 |  |  |
| -0.0816814089934469 | 0.997 | -0.081 | 0.007 |  |  |
| -0.0753982236862674 | 0.997 | -0.075 | 0.006 |  |  |
| -0.0691150383790878 | 0.998 | -0.069 | 0.005 |  |  |
| -0.0628318530719082 | 0.998 | -0.063 | 0.004 |  |  |
| -0.0565486677647286 | 0.998 | -0.056 | 0.003 |  |  |
| -0.050265482457549 | 0.999 | -0.05 | 0.003 |  |  |
| -0.0439822971503694 | 0.999 | -0.044 | 0.002 |  |  |
| -0.0376991118431899 | 0.999 | -0.038 | 0.001 |  |  |
| -0.0314159265360103 | 1 | -0.031 | 0.001 |  |  |
| -0.0251327412288307 | 1 | -0.025 | 0.001 |  |  |
| -0.0188495559216511 | 1 | -0.019 | 0 |  |  |
| -0.0125663706144715 | 1 | -0.013 | 0 |  |  |
| -0.00628318530729192 | 1 | -0.006 | 0 |  |  |
| -1.12338957580782e-13 | 1 | 0 | 0 |  |  |
| 0.00628318530706725 | 1 | 0.006 | 0 |  |  |
| 0.0125663706142468 | 1 | 0.013 | 0 |  |  |
| 0.0188495559214264 | 1 | 0.019 | 0 |  |  |
| 0.025132741228606 | 1 | 0.025 | 0.001 |  |  |
| 0.0314159265357856 | 1 | 0.031 | 0.001 |  |  |
| 0.0376991118429652 | 0.999 | 0.038 | 0.001 |  |  |
| 0.0439822971501448 | 0.999 | 0.044 | 0.002 |  |  |
| 0.0502654824573243 | 0.999 | 0.05 | 0.003 |  |  |
| 0.0565486677645039 | 0.998 | 0.056 | 0.003 |  |  |
| 0.0628318530716835 | 0.998 | 0.063 | 0.004 |  |  |
| 0.0691150383788631 | 0.998 | 0.069 | 0.005 |  |  |
| 0.0753982236860427 | 0.997 | 0.075 | 0.006 |  |  |
| 0.0816814089932222 | 0.997 | 0.081 | 0.007 |  |  |
| 0.0879645943004018 | 0.996 | 0.088 | 0.008 |  |  |
| 0.0942477796075814 | 0.996 | 0.094 | 0.009 |  |  |
| 0.100530964914761 | 0.995 | 0.1 | 0.01 |  |  |
| 0.106814150221941 | 0.994 | 0.106 | 0.011 |  |  |
| 0.11309733552912 | 0.994 | 0.112 | 0.013 |  |  |
| 0.1193805208363 | 0.993 | 0.119 | 0.014 |  |  |
| 0.125663706143479 | 0.992 | 0.125 | 0.016 |  |  |
| 0.131946891450659 | 0.991 | 0.131 | 0.017 |  |  |
| 0.138230076757839 | 0.99 | 0.137 | 0.019 |  |  |
| 0.144513262065018 | 0.99 | 0.143 | 0.021 |  |  |
| 0.150796447372198 | 0.989 | 0.149 | 0.022 |  |  |
| 0.157079632679377 | 0.988 | 0.155 | 0.024 |  |  |
| 0.163362817986557 | 0.987 | 0.161 | 0.026 |  |  |
| 0.169646003293736 | 0.986 | 0.167 | 0.028 |  |  |
| 0.175929188600916 | 0.985 | 0.173 | 0.03 |  |  |
| 0.182212373908096 | 0.983 | 0.179 | 0.033 |  |  |
| 0.188495559215275 | 0.982 | 0.185 | 0.035 |  |  |
| 0.194778744522455 | 0.981 | 0.191 | 0.037 |  |  |
| 0.201061929829634 | 0.98 | 0.197 | 0.04 |  |  |
| 0.207345115136814 | 0.979 | 0.203 | 0.042 |  |  |
| 0.213628300443994 | 0.977 | 0.209 | 0.045 |  |  |
| 0.219911485751173 | 0.976 | 0.215 | 0.047 |  |  |
| 0.226194671058353 | 0.975 | 0.22 | 0.05 |  |  |
| 0.232477856365532 | 0.973 | 0.226 | 0.053 |  |  |
| 0.238761041672712 | 0.972 | 0.232 | 0.055 |  |  |
| 0.245044226979891 | 0.97 | 0.238 | 0.058 |  |  |
| 0.251327412287071 | 0.969 | 0.243 | 0.061 |  |  |
| 0.257610597594251 | 0.967 | 0.249 | 0.064 |  |  |
| 0.26389378290143 | 0.965 | 0.255 | 0.067 |  |  |
| 0.27017696820861 | 0.964 | 0.26 | 0.07 |  |  |
| 0.276460153515789 | 0.962 | 0.266 | 0.074 |  |  |
| 0.282743338822969 | 0.96 | 0.272 | 0.077 |  |  |
| 0.289026524130149 | 0.959 | 0.277 | 0.08 |  |  |
| 0.295309709437328 | 0.957 | 0.283 | 0.083 |  |  |
| 0.301592894744508 | 0.955 | 0.288 | 0.087 |  |  |
| 0.307876080051687 | 0.953 | 0.293 | 0.09 |  |  |
| 0.314159265358867 | 0.951 | 0.299 | 0.094 |  |  |
| 0.320442450666046 | 0.949 | 0.304 | 0.097 |  |  |
| 0.326725635973226 | 0.947 | 0.309 | 0.101 |  |  |
| 0.333008821280406 | 0.945 | 0.315 | 0.105 |  |  |
| 0.339292006587585 | 0.943 | 0.32 | 0.109 |  |  |
| 0.345575191894765 | 0.941 | 0.325 | 0.112 |  |  |
| 0.351858377201944 | 0.939 | 0.33 | 0.116 |  |  |
| 0.358141562509124 | 0.937 | 0.335 | 0.12 |  |  |
| 0.364424747816304 | 0.934 | 0.34 | 0.124 |  |  |
| 0.370707933123483 | 0.932 | 0.346 | 0.128 |  |  |
| 0.376991118430663 | 0.93 | 0.351 | 0.132 |  |  |
| 0.383274303737842 | 0.927 | 0.355 | 0.136 |  |  |
| 0.389557489045022 | 0.925 | 0.36 | 0.14 |  |  |
| 0.395840674352201 | 0.923 | 0.365 | 0.145 |  |  |
| 0.402123859659381 | 0.92 | 0.37 | 0.149 |  |  |
| 0.408407044966561 | 0.918 | 0.375 | 0.153 |  |  |
| 0.41469023027374 | 0.915 | 0.38 | 0.157 |  |  |
| 0.42097341558092 | 0.913 | 0.384 | 0.162 |  |  |
| 0.427256600888099 | 0.91 | 0.389 | 0.166 |  |  |
| 0.433539786195279 | 0.907 | 0.393 | 0.171 |  |  |
| 0.439822971502459 | 0.905 | 0.398 | 0.175 |  |  |
| 0.446106156809638 | 0.902 | 0.402 | 0.18 |  |  |
| 0.452389342116818 | 0.899 | 0.407 | 0.184 |  |  |
| 0.458672527423997 | 0.897 | 0.411 | 0.189 |  |  |
| 0.464955712731177 | 0.894 | 0.416 | 0.193 |  |  |
| 0.471238898038356 | 0.891 | 0.42 | 0.198 |  |  |
| 0.477522083345536 | 0.888 | 0.424 | 0.203 |  |  |
| 0.483805268652716 | 0.885 | 0.428 | 0.207 |  |  |
| 0.490088453959895 | 0.882 | 0.432 | 0.212 |  |  |
| 0.496371639267075 | 0.879 | 0.436 | 0.217 |  |  |
| 0.502654824574254 | 0.876 | 0.44 | 0.221 |  |  |
| 0.508938009881434 | 0.873 | 0.444 | 0.226 |  |  |
| 0.515221195188614 | 0.87 | 0.448 | 0.231 |  |  |
| 0.521504380495793 | 0.867 | 0.452 | 0.236 |  |  |
| 0.527787565802973 | 0.864 | 0.456 | 0.241 |  |  |
| 0.534070751110153 | 0.861 | 0.46 | 0.246 |  |  |
| 0.540353936417332 | 0.858 | 0.463 | 0.25 |  |  |
| 0.546637121724512 | 0.854 | 0.467 | 0.255 |  |  |
| 0.552920307031692 | 0.851 | 0.471 | 0.26 |  |  |
| 0.559203492338871 | 0.848 | 0.474 | 0.265 |  |  |
| 0.565486677646051 | 0.844 | 0.477 | 0.27 |  |  |
| 0.571769862953231 | 0.841 | 0.481 | 0.275 |  |  |
| 0.57805304826041 | 0.838 | 0.484 | 0.28 |  |  |
| 0.58433623356759 | 0.834 | 0.487 | 0.285 |  |  |
| 0.590619418874769 | 0.831 | 0.491 | 0.29 |  |  |
| 0.596902604181949 | 0.827 | 0.494 | 0.295 |  |  |
| 0.603185789489129 | 0.824 | 0.497 | 0.3 |  |  |
| 0.609468974796308 | 0.82 | 0.5 | 0.305 |  |  |
| 0.615752160103488 | 0.816 | 0.503 | 0.31 |  |  |
| 0.622035345410668 | 0.813 | 0.506 | 0.314 |  |  |
| 0.628318530717847 | 0.809 | 0.508 | 0.319 |  |  |
| 0.634601716025027 | 0.805 | 0.511 | 0.324 |  |  |
| 0.640884901332206 | 0.802 | 0.514 | 0.329 |  |  |
| 0.647168086639386 | 0.798 | 0.516 | 0.334 |  |  |
| 0.653451271946566 | 0.794 | 0.519 | 0.339 |  |  |
| 0.659734457253745 | 0.79 | 0.521 | 0.344 |  |  |
| 0.666017642560925 | 0.786 | 0.524 | 0.349 |  |  |
| 0.672300827868105 | 0.782 | 0.526 | 0.354 |  |  |
| 0.678584013175284 | 0.778 | 0.528 | 0.358 |  |  |
| 0.684867198482464 | 0.775 | 0.53 | 0.363 |  |  |
| 0.691150383789644 | 0.771 | 0.533 | 0.368 |  |  |
| 0.697433569096823 | 0.766 | 0.535 | 0.373 |  |  |
| 0.703716754404003 | 0.762 | 0.537 | 0.378 |  |  |
| 0.709999939711183 | 0.758 | 0.538 | 0.382 |  |  |
| 0.716283125018362 | 0.754 | 0.54 | 0.387 |  |  |
| 0.722566310325542 | 0.75 | 0.542 | 0.392 |  |  |
| 0.728849495632721 | 0.746 | 0.544 | 0.396 |  |  |
| 0.735132680939901 | 0.742 | 0.545 | 0.401 |  |  |
| 0.741415866247081 | 0.738 | 0.547 | 0.405 |  |  |
| 0.74769905155426 | 0.733 | 0.548 | 0.41 |  |  |
| 0.75398223686144 | 0.729 | 0.55 | 0.414 |  |  |
| 0.76026542216862 | 0.725 | 0.551 | 0.419 |  |  |
| 0.766548607475799 | 0.72 | 0.552 | 0.423 |  |  |
| 0.772831792782979 | 0.716 | 0.553 | 0.428 |  |  |
| 0.779114978090159 | 0.712 | 0.554 | 0.432 |  |  |
| 0.785398163397338 | 0.707 | 0.555 | 0.436 |  |  |
| 0.791681348704518 | 0.703 | 0.556 | 0.44 |  |  |
| 0.797964534011697 | 0.698 | 0.557 | 0.445 |  |  |
| 0.804247719318877 | 0.694 | 0.558 | 0.449 |  |  |
| 0.810530904626057 | 0.689 | 0.559 | 0.453 |  |  |
| 0.816814089933236 | 0.685 | 0.559 | 0.457 |  |  |
| 0.823097275240416 | 0.68 | 0.56 | 0.461 |  |  |
| 0.829380460547596 | 0.675 | 0.56 | 0.465 |  |  |
| 0.835663645854775 | 0.671 | 0.56 | 0.468 |  |  |
| 0.841946831161955 | 0.666 | 0.561 | 0.472 |  |  |
| 0.848230016469135 | 0.661 | 0.561 | 0.476 |  |  |
| 0.854513201776314 | 0.657 | 0.561 | 0.479 |  |  |
| 0.860796387083494 | 0.652 | 0.561 | 0.483 |  |  |
| 0.867079572390674 | 0.647 | 0.561 | 0.486 |  |  |
| 0.873362757697853 | 0.642 | 0.561 | 0.49 |  |  |
| 0.879645943005033 | 0.637 | 0.561 | 0.493 |  |  |
| 0.885929128312212 | 0.633 | 0.56 | 0.496 |  |  |
| 0.892212313619392 | 0.628 | 0.56 | 0.5 |  |  |
| 0.898495498926572 | 0.623 | 0.56 | 0.503 |  |  |
| 0.904778684233751 | 0.618 | 0.559 | 0.506 |  |  |
| 0.911061869540931 | 0.613 | 0.558 | 0.509 |  |  |
| 0.917345054848111 | 0.608 | 0.558 | 0.512 |  |  |
| 0.92362824015529 | 0.603 | 0.557 | 0.514 |  |  |
| 0.92991142546247 | 0.598 | 0.556 | 0.517 |  |  |
| 0.93619461076965 | 0.593 | 0.555 | 0.52 |  |  |
| 0.942477796076829 | 0.588 | 0.554 | 0.522 |  |  |
| 0.948760981384009 | 0.583 | 0.553 | 0.525 |  |  |
| 0.955044166691188 | 0.578 | 0.552 | 0.527 |  |  |
| 0.961327351998368 | 0.572 | 0.55 | 0.529 |  |  |
| 0.967610537305548 | 0.567 | 0.549 | 0.531 |  |  |
| 0.973893722612727 | 0.562 | 0.547 | 0.533 |  |  |
| 0.980176907919907 | 0.557 | 0.546 | 0.535 |  |  |
| 0.986460093227087 | 0.552 | 0.544 | 0.537 |  |  |
| 0.992743278534266 | 0.546 | 0.542 | 0.538 |  |  |
| 0.999026463841446 | 0.541 | 0.541 | 0.54 |  |  |
| 1.005309649148626 | 0.536 | 0.539 | 0.542 |  |  |
| 1.011592834455805 | 0.531 | 0.537 | 0.543 |  |  |
| 1.017876019762985 | 0.525 | 0.535 | 0.544 |  |  |
| 1.024159205070164 | 0.52 | 0.532 | 0.545 |  |  |
| 1.030442390377344 | 0.514 | 0.53 | 0.546 |  |  |
| 1.036725575684524 | 0.509 | 0.528 | 0.547 |  |  |
| 1.043008760991703 | 0.504 | 0.525 | 0.548 |  |  |
| 1.049291946298883 | 0.498 | 0.523 | 0.549 |  |  |
| 1.055575131606063 | 0.493 | 0.52 | 0.549 |  |  |
| 1.061858316913242 | 0.487 | 0.517 | 0.549 |  |  |
| 1.068141502220422 | 0.482 | 0.515 | 0.55 |  |  |
| 1.074424687527602 | 0.476 | 0.512 | 0.55 |  |  |
| 1.080707872834781 | 0.471 | 0.509 | 0.55 |  |  |
| 1.086991058141961 | 0.465 | 0.506 | 0.55 |  |  |
| 1.09327424344914 | 0.46 | 0.502 | 0.549 |  |  |
| 1.09955742875632 | 0.454 | 0.499 | 0.549 |  |  |
| 1.1058406140635 | 0.448 | 0.496 | 0.548 |  |  |
| 1.112123799370679 | 0.443 | 0.492 | 0.548 |  |  |
| 1.11840698467786 | 0.437 | 0.489 | 0.547 |  |  |
| 1.124690169985039 | 0.431 | 0.485 | 0.546 |  |  |
| 1.130973355292218 | 0.426 | 0.482 | 0.545 |  |  |
| 1.137256540599398 | 0.42 | 0.478 | 0.543 |  |  |
| 1.143539725906578 | 0.414 | 0.474 | 0.542 |  |  |
| 1.149822911213757 | 0.409 | 0.47 | 0.54 |  |  |
| 1.156106096520937 | 0.403 | 0.466 | 0.539 |  |  |
| 1.162389281828116 | 0.397 | 0.462 | 0.537 |  |  |
| 1.168672467135296 | 0.391 | 0.457 | 0.535 |  |  |
| 1.174955652442476 | 0.386 | 0.453 | 0.532 |  |  |
| 1.181238837749655 | 0.38 | 0.449 | 0.53 |  |  |
| 1.187522023056835 | 0.374 | 0.444 | 0.527 |  |  |
| 1.193805208364015 | 0.368 | 0.439 | 0.525 |  |  |
| 1.200088393671194 | 0.362 | 0.435 | 0.522 |  |  |
| 1.206371578978374 | 0.356 | 0.43 | 0.519 |  |  |
| 1.212654764285554 | 0.351 | 0.425 | 0.515 |  |  |
| 1.218937949592733 | 0.345 | 0.42 | 0.512 |  |  |
| 1.225221134899913 | 0.339 | 0.415 | 0.509 |  |  |
| 1.231504320207093 | 0.333 | 0.41 | 0.505 |  |  |
| 1.237787505514272 | 0.327 | 0.405 | 0.501 |  |  |
| 1.244070690821452 | 0.321 | 0.399 | 0.497 |  |  |
| 1.250353876128631 | 0.315 | 0.394 | 0.492 |  |  |
| 1.256637061435811 | 0.309 | 0.388 | 0.488 |  |  |
| 1.262920246742991 | 0.303 | 0.383 | 0.483 |  |  |
| 1.26920343205017 | 0.297 | 0.377 | 0.478 |  |  |
| 1.27548661735735 | 0.291 | 0.371 | 0.473 |  |  |
| 1.28176980266453 | 0.285 | 0.365 | 0.468 |  |  |
| 1.28805298797171 | 0.279 | 0.359 | 0.463 |  |  |
| 1.294336173278889 | 0.273 | 0.353 | 0.457 |  |  |
| 1.300619358586069 | 0.267 | 0.347 | 0.451 |  |  |
| 1.306902543893248 | 0.261 | 0.341 | 0.446 |  |  |
| 1.313185729200428 | 0.255 | 0.335 | 0.439 |  |  |
| 1.319468914507607 | 0.249 | 0.328 | 0.433 |  |  |
| 1.325752099814787 | 0.243 | 0.322 | 0.426 |  |  |
| 1.332035285121967 | 0.236 | 0.315 | 0.42 |  |  |
| 1.338318470429146 | 0.23 | 0.308 | 0.413 |  |  |
| 1.344601655736326 | 0.224 | 0.302 | 0.405 |  |  |
| 1.350884841043506 | 0.218 | 0.295 | 0.398 |  |  |
| 1.357168026350685 | 0.212 | 0.288 | 0.39 |  |  |
| 1.363451211657865 | 0.206 | 0.281 | 0.383 |  |  |
| 1.369734396965045 | 0.2 | 0.274 | 0.375 |  |  |
| 1.376017582272224 | 0.194 | 0.266 | 0.366 |  |  |
| 1.382300767579404 | 0.187 | 0.259 | 0.358 |  |  |
| 1.388583952886583 | 0.181 | 0.252 | 0.349 |  |  |
| 1.394867138193763 | 0.175 | 0.244 | 0.341 |  |  |
| 1.401150323500943 | 0.169 | 0.237 | 0.331 |  |  |
| 1.407433508808122 | 0.163 | 0.229 | 0.322 |  |  |
| 1.413716694115302 | 0.156 | 0.221 | 0.313 |  |  |
| 1.419999879422482 | 0.15 | 0.213 | 0.303 |  |  |
| 1.426283064729661 | 0.144 | 0.205 | 0.293 |  |  |
| 1.432566250036841 | 0.138 | 0.197 | 0.283 |  |  |
| 1.438849435344021 | 0.132 | 0.189 | 0.272 |  |  |
| 1.4451326206512 | 0.125 | 0.181 | 0.262 |  |  |
| 1.45141580595838 | 0.119 | 0.173 | 0.251 |  |  |
| 1.45769899126556 | 0.113 | 0.165 | 0.24 |  |  |
| 1.46398217657274 | 0.107 | 0.156 | 0.228 |  |  |
| 1.470265361879919 | 0.1 | 0.148 | 0.217 |  |  |
| 1.476548547187098 | 0.094 | 0.139 | 0.205 |  |  |
| 1.482831732494278 | 0.088 | 0.13 | 0.193 |  |  |
| 1.489114917801458 | 0.082 | 0.121 | 0.181 |  |  |
| 1.495398103108637 | 0.075 | 0.113 | 0.168 |  |  |
| 1.501681288415817 | 0.069 | 0.104 | 0.156 |  |  |
| 1.507964473722997 | 0.063 | 0.095 | 0.143 |  |  |
| 1.514247659030176 | 0.057 | 0.086 | 0.13 |  |  |
| 1.520530844337356 | 0.05 | 0.076 | 0.116 |  |  |
| 1.526814029644536 | 0.044 | 0.067 | 0.102 |  |  |
| 1.533097214951715 | 0.038 | 0.058 | 0.089 |  |  |
| 1.539380400258895 | 0.031 | 0.048 | 0.074 |  |  |
| 1.545663585566075 | 0.025 | 0.039 | 0.06 |  |  |
| 1.551946770873254 | 0.019 | 0.029 | 0.045 |  |  |
| 1.558229956180434 | 0.013 | 0.02 | 0.031 |  |  |
| 1.564513141487613 | 0.006 | 0.01 | 0.015 |  |  |
| 1.570796326794793 | 0 | 0 | 0 |  |  |
| 1.577079512101973 | -0.006 | -0.01 | -0.016 |  |  |
| 1.583362697409152 | -0.013 | -0.02 | -0.032 |  |  |
| 1.589645882716332 | -0.019 | -0.03 | -0.048 |  |  |
| 1.595929068023512 | -0.025 | -0.04 | -0.064 |  |  |
| 1.602212253330691 | -0.031 | -0.05 | -0.081 |  |  |
| 1.608495438637871 | -0.038 | -0.061 | -0.098 |  |  |
| 1.61477862394505 | -0.044 | -0.071 | -0.115 |  |  |
| 1.62106180925223 | -0.05 | -0.081 | -0.132 |  |  |
| 1.62734499455941 | -0.057 | -0.092 | -0.15 |  |  |
| 1.633628179866589 | -0.063 | -0.103 | -0.168 |  |  |
| 1.63991136517377 | -0.069 | -0.113 | -0.186 |  |  |
| 1.646194550480949 | -0.075 | -0.124 | -0.204 |  |  |
| 1.652477735788128 | -0.082 | -0.135 | -0.223 |  |  |
| 1.658760921095308 | -0.088 | -0.146 | -0.242 |  |  |
| 1.665044106402488 | -0.094 | -0.157 | -0.261 |  |  |
| 1.671327291709667 | -0.1 | -0.168 | -0.28 |  |  |
| 1.677610477016847 | -0.107 | -0.179 | -0.3 |  |  |
| 1.683893662324026 | -0.113 | -0.19 | -0.32 |  |  |
| 1.690176847631206 | -0.119 | -0.201 | -0.34 |  |  |
| 1.696460032938386 | -0.125 | -0.213 | -0.361 |  |  |
| 1.702743218245565 | -0.132 | -0.224 | -0.381 |  |  |
| 1.709026403552745 | -0.138 | -0.235 | -0.402 |  |  |
| 1.715309588859925 | -0.144 | -0.247 | -0.424 |  |  |
| 1.721592774167104 | -0.15 | -0.259 | -0.445 |  |  |
| 1.727875959474284 | -0.156 | -0.27 | -0.467 |  |  |
| 1.734159144781464 | -0.163 | -0.282 | -0.489 |  |  |
| 1.740442330088643 | -0.169 | -0.294 | -0.511 |  |  |
| 1.746725515395823 | -0.175 | -0.306 | -0.534 |  |  |
| 1.753008700703003 | -0.181 | -0.318 | -0.557 |  |  |
| 1.759291886010182 | -0.187 | -0.33 | -0.58 |  |  |
| 1.765575071317362 | -0.194 | -0.342 | -0.603 |  |  |
| 1.771858256624541 | -0.2 | -0.354 | -0.627 |  |  |
| 1.778141441931721 | -0.206 | -0.366 | -0.651 |  |  |
| 1.784424627238901 | -0.212 | -0.378 | -0.675 |  |  |
| 1.79070781254608 | -0.218 | -0.391 | -0.7 |  |  |
| 1.79699099785326 | -0.224 | -0.403 | -0.724 |  |  |
| 1.80327418316044 | -0.23 | -0.415 | -0.749 |  |  |
| 1.809557368467619 | -0.236 | -0.428 | -0.774 |  |  |
| 1.815840553774799 | -0.243 | -0.441 | -0.8 |  |  |
| 1.822123739081979 | -0.249 | -0.453 | -0.826 |  |  |
| 1.828406924389158 | -0.255 | -0.466 | -0.852 |  |  |
| 1.834690109696338 | -0.261 | -0.479 | -0.878 |  |  |
| 1.840973295003518 | -0.267 | -0.491 | -0.905 |  |  |
| 1.847256480310697 | -0.273 | -0.504 | -0.931 |  |  |
| 1.853539665617877 | -0.279 | -0.517 | -0.959 |  |  |
| 1.859822850925056 | -0.285 | -0.53 | -0.986 |  |  |
| 1.866106036232236 | -0.291 | -0.543 | -1.013 |  |  |
| 1.872389221539416 | -0.297 | -0.556 | -1.041 |  |  |
| 1.878672406846595 | -0.303 | -0.569 | -1.07 |  |  |
| 1.884955592153775 | -0.309 | -0.582 | -1.098 |  |  |
| 1.891238777460955 | -0.315 | -0.596 | -1.127 |  |  |
| 1.897521962768134 | -0.321 | -0.609 | -1.156 |  |  |
| 1.903805148075314 | -0.327 | -0.622 | -1.185 |  |  |
| 1.910088333382494 | -0.333 | -0.636 | -1.214 |  |  |
| 1.916371518689673 | -0.339 | -0.649 | -1.244 |  |  |
| 1.922654703996853 | -0.345 | -0.663 | -1.274 |  |  |
| 1.928937889304033 | -0.351 | -0.676 | -1.304 |  |  |
| 1.935221074611212 | -0.356 | -0.69 | -1.335 |  |  |
| 1.941504259918392 | -0.362 | -0.703 | -1.366 |  |  |
| 1.947787445225571 | -0.368 | -0.717 | -1.397 |  |  |
| 1.954070630532751 | -0.374 | -0.731 | -1.428 |  |  |
| 1.960353815839931 | -0.38 | -0.745 | -1.459 |  |  |
| 1.96663700114711 | -0.386 | -0.758 | -1.491 |  |  |
| 1.97292018645429 | -0.391 | -0.772 | -1.523 |  |  |
| 1.97920337176147 | -0.397 | -0.786 | -1.556 |  |  |
| 1.985486557068649 | -0.403 | -0.8 | -1.588 |  |  |
| 1.991769742375829 | -0.409 | -0.814 | -1.621 |  |  |
| 1.998052927683009 | -0.414 | -0.828 | -1.654 |  |  |
| 2.004336112990188 | -0.42 | -0.842 | -1.688 |  |  |
| 2.010619298297368 | -0.426 | -0.856 | -1.721 |  |  |
| 2.016902483604547 | -0.431 | -0.87 | -1.755 |  |  |
| 2.023185668911727 | -0.437 | -0.884 | -1.789 |  |  |
| 2.029468854218907 | -0.443 | -0.899 | -1.824 |  |  |
| 2.035752039526086 | -0.448 | -0.913 | -1.858 |  |  |
| 2.042035224833266 | -0.454 | -0.927 | -1.893 |  |  |
| 2.048318410140446 | -0.46 | -0.941 | -1.928 |  |  |
| 2.054601595447625 | -0.465 | -0.956 | -1.964 |  |  |
| 2.060884780754805 | -0.471 | -0.97 | -1.999 |  |  |
| 2.067167966061984 | -0.476 | -0.984 | -2.035 |  |  |
| 2.073451151369164 | -0.482 | -0.999 | -2.071 |  |  |
| 2.079734336676344 | -0.487 | -1.013 | -2.108 |  |  |
| 2.086017521983524 | -0.493 | -1.028 | -2.144 |  |  |
| 2.092300707290703 | -0.498 | -1.042 | -2.181 |  |  |
| 2.098583892597883 | -0.504 | -1.057 | -2.218 |  |  |
| 2.104867077905062 | -0.509 | -1.071 | -2.255 |  |  |
| 2.111150263212242 | -0.514 | -1.086 | -2.293 |  |  |
| 2.117433448519422 | -0.52 | -1.101 | -2.331 |  |  |
| 2.123716633826601 | -0.525 | -1.115 | -2.369 |  |  |
| 2.129999819133781 | -0.531 | -1.13 | -2.407 |  |  |
| 2.136283004440961 | -0.536 | -1.145 | -2.445 |  |  |
| 2.14256618974814 | -0.541 | -1.159 | -2.484 |  |  |
| 2.14884937505532 | -0.546 | -1.174 | -2.523 |  |  |
| 2.1551325603625 | -0.552 | -1.189 | -2.562 |  |  |
| 2.16141574566968 | -0.557 | -1.204 | -2.602 |  |  |
| 2.167698930976859 | -0.562 | -1.218 | -2.641 |  |  |
| 2.173982116284038 | -0.567 | -1.233 | -2.681 |  |  |
| 2.180265301591218 | -0.572 | -1.248 | -2.721 |  |  |
| 2.186548486898398 | -0.578 | -1.263 | -2.761 |  |  |
| 2.192831672205577 | -0.583 | -1.278 | -2.802 |  |  |
| 2.199114857512757 | -0.588 | -1.293 | -2.843 |  |  |
| 2.205398042819936 | -0.593 | -1.307 | -2.884 |  |  |
| 2.211681228127116 | -0.598 | -1.322 | -2.925 |  |  |
| 2.217964413434296 | -0.603 | -1.337 | -2.966 |  |  |
| 2.224247598741475 | -0.608 | -1.352 | -3.008 |  |  |
| 2.230530784048655 | -0.613 | -1.367 | -3.049 |  |  |
| 2.236813969355835 | -0.618 | -1.382 | -3.091 |  |  |
| 2.243097154663014 | -0.623 | -1.397 | -3.134 |  |  |
| 2.249380339970194 | -0.628 | -1.412 | -3.176 |  |  |
| 2.255663525277374 | -0.633 | -1.427 | -3.219 |  |  |
| 2.261946710584553 | -0.637 | -1.442 | -3.261 |  |  |
| 2.268229895891733 | -0.642 | -1.457 | -3.304 |  |  |
| 2.274513081198912 | -0.647 | -1.472 | -3.347 |  |  |
| 2.280796266506092 | -0.652 | -1.487 | -3.391 |  |  |
| 2.287079451813272 | -0.657 | -1.502 | -3.434 |  |  |
| 2.293362637120452 | -0.661 | -1.517 | -3.478 |  |  |
| 2.299645822427631 | -0.666 | -1.532 | -3.522 |  |  |
| 2.305929007734811 | -0.671 | -1.547 | -3.566 |  |  |
| 2.312212193041991 | -0.675 | -1.562 | -3.611 |  |  |
| 2.31849537834917 | -0.68 | -1.576 | -3.655 |  |  |
| 2.32477856365635 | -0.685 | -1.591 | -3.7 |  |  |
| 2.331061748963529 | -0.689 | -1.606 | -3.745 |  |  |
| 2.337344934270709 | -0.694 | -1.621 | -3.79 |  |  |
| 2.343628119577889 | -0.698 | -1.636 | -3.835 |  |  |
| 2.349911304885068 | -0.703 | -1.651 | -3.88 |  |  |
| 2.356194490192248 | -0.707 | -1.666 | -3.926 |  |  |
| 2.362477675499428 | -0.712 | -1.681 | -3.971 |  |  |
| 2.368760860806607 | -0.716 | -1.696 | -4.017 |  |  |
| 2.375044046113787 | -0.72 | -1.711 | -4.063 |  |  |
| 2.381327231420966 | -0.725 | -1.726 | -4.109 |  |  |
| 2.387610416728146 | -0.729 | -1.74 | -4.156 |  |  |
| 2.393893602035326 | -0.733 | -1.755 | -4.202 |  |  |
| 2.400176787342505 | -0.738 | -1.77 | -4.249 |  |  |
| 2.406459972649685 | -0.742 | -1.785 | -4.295 |  |  |
| 2.412743157956865 | -0.746 | -1.8 | -4.342 |  |  |
| 2.419026343264044 | -0.75 | -1.815 | -4.389 |  |  |
| 2.425309528571224 | -0.754 | -1.829 | -4.437 |  |  |
| 2.431592713878404 | -0.758 | -1.844 | -4.484 |  |  |
| 2.437875899185583 | -0.762 | -1.859 | -4.531 |  |  |
| 2.444159084492763 | -0.766 | -1.873 | -4.579 |  |  |
| 2.450442269799943 | -0.771 | -1.888 | -4.627 |  |  |
| 2.456725455107122 | -0.775 | -1.903 | -4.675 |  |  |
| 2.463008640414302 | -0.778 | -1.917 | -4.722 |  |  |
| 2.469291825721482 | -0.782 | -1.932 | -4.771 |  |  |
| 2.475575011028661 | -0.786 | -1.947 | -4.819 |  |  |
| 2.481858196335841 | -0.79 | -1.961 | -4.867 |  |  |
| 2.48814138164302 | -0.794 | -1.976 | -4.915 |  |  |
| 2.4944245669502 | -0.798 | -1.99 | -4.964 |  |  |
| 2.50070775225738 | -0.802 | -2.004 | -5.013 |  |  |
| 2.506990937564559 | -0.805 | -2.019 | -5.061 |  |  |
| 2.51327412287174 | -0.809 | -2.033 | -5.11 |  |  |
| 2.519557308178919 | -0.813 | -2.048 | -5.159 |  |  |
| 2.525840493486098 | -0.816 | -2.062 | -5.208 |  |  |
| 2.532123678793278 | -0.82 | -2.076 | -5.257 |  |  |
| 2.538406864100458 | -0.824 | -2.09 | -5.306 |  |  |
| 2.544690049407637 | -0.827 | -2.105 | -5.356 |  |  |
| 2.550973234714817 | -0.831 | -2.119 | -5.405 |  |  |
| 2.557256420021996 | -0.834 | -2.133 | -5.455 |  |  |
| 2.563539605329176 | -0.838 | -2.147 | -5.504 |  |  |
| 2.569822790636356 | -0.841 | -2.161 | -5.554 |  |  |
| 2.576105975943535 | -0.844 | -2.175 | -5.603 |  |  |
| 2.582389161250715 | -0.848 | -2.189 | -5.653 |  |  |
| 2.588672346557895 | -0.851 | -2.203 | -5.703 |  |  |
| 2.594955531865074 | -0.854 | -2.217 | -5.753 |  |  |
| 2.601238717172254 | -0.858 | -2.231 | -5.802 |  |  |
| 2.607521902479433 | -0.861 | -2.244 | -5.852 |  |  |
| 2.613805087786613 | -0.864 | -2.258 | -5.902 |  |  |
| 2.620088273093793 | -0.867 | -2.272 | -5.952 |  |  |
| 2.626371458400972 | -0.87 | -2.285 | -6.002 |  |  |
| 2.632654643708152 | -0.873 | -2.299 | -6.052 |  |  |
| 2.638937829015332 | -0.876 | -2.313 | -6.103 |  |  |
| 2.645221014322511 | -0.879 | -2.326 | -6.153 |  |  |
| 2.651504199629691 | -0.882 | -2.339 | -6.203 |  |  |
| 2.657787384936871 | -0.885 | -2.353 | -6.253 |  |  |
| 2.66407057024405 | -0.888 | -2.366 | -6.303 |  |  |
| 2.67035375555123 | -0.891 | -2.379 | -6.354 |  |  |
| 2.67663694085841 | -0.894 | -2.392 | -6.404 |  |  |
| 2.682920126165589 | -0.897 | -2.406 | -6.454 |  |  |
| 2.689203311472769 | -0.899 | -2.419 | -6.504 |  |  |
| 2.695486496779948 | -0.902 | -2.432 | -6.555 |  |  |
| 2.701769682087128 | -0.905 | -2.445 | -6.605 |  |  |
| 2.708052867394308 | -0.907 | -2.458 | -6.655 |  |  |
| 2.714336052701487 | -0.91 | -2.47 | -6.705 |  |  |
| 2.720619238008667 | -0.913 | -2.483 | -6.756 |  |  |
| 2.726902423315847 | -0.915 | -2.496 | -6.806 |  |  |
| 2.733185608623026 | -0.918 | -2.508 | -6.856 |  |  |
| 2.739468793930206 | -0.92 | -2.521 | -6.906 |  |  |
| 2.745751979237386 | -0.923 | -2.533 | -6.956 |  |  |
| 2.752035164544565 | -0.925 | -2.546 | -7.006 |  |  |
| 2.758318349851745 | -0.927 | -2.558 | -7.056 |  |  |
| 2.764601535158925 | -0.93 | -2.57 | -7.106 |  |  |
| 2.770884720466104 | -0.932 | -2.583 | -7.156 |  |  |
| 2.777167905773284 | -0.934 | -2.595 | -7.206 |  |  |
| 2.783451091080463 | -0.937 | -2.607 | -7.256 |  |  |
| 2.789734276387643 | -0.939 | -2.619 | -7.306 |  |  |
| 2.796017461694823 | -0.941 | -2.631 | -7.356 |  |  |
| 2.802300647002002 | -0.943 | -2.643 | -7.405 |  |  |
| 2.808583832309182 | -0.945 | -2.654 | -7.455 |  |  |
| 2.814867017616362 | -0.947 | -2.666 | -7.504 |  |  |
| 2.821150202923541 | -0.949 | -2.678 | -7.554 |  |  |
| 2.827433388230721 | -0.951 | -2.689 | -7.603 |  |  |
| 2.833716573537901 | -0.953 | -2.7 | -7.652 |  |  |
| 2.83999975884508 | -0.955 | -2.712 | -7.702 |  |  |
| 2.84628294415226 | -0.957 | -2.723 | -7.751 |  |  |
| 2.852566129459439 | -0.959 | -2.734 | -7.8 |  |  |
| 2.858849314766619 | -0.96 | -2.745 | -7.848 |  |  |
| 2.865132500073799 | -0.962 | -2.756 | -7.897 |  |  |
| 2.871415685380978 | -0.964 | -2.767 | -7.946 |  |  |
| 2.877698870688158 | -0.965 | -2.778 | -7.994 |  |  |
| 2.883982055995337 | -0.967 | -2.789 | -8.043 |  |  |
| 2.890265241302517 | -0.969 | -2.799 | -8.091 |  |  |
| 2.896548426609697 | -0.97 | -2.81 | -8.139 |  |  |
| 2.902831611916877 | -0.972 | -2.82 | -8.187 |  |  |
| 2.909114797224056 | -0.973 | -2.831 | -8.235 |  |  |
| 2.915397982531236 | -0.975 | -2.841 | -8.283 |  |  |
| 2.921681167838416 | -0.976 | -2.851 | -8.331 |  |  |
| 2.927964353145595 | -0.977 | -2.861 | -8.378 |  |  |
| 2.934247538452775 | -0.979 | -2.871 | -8.425 |  |  |
| 2.940530723759954 | -0.98 | -2.881 | -8.473 |  |  |
| 2.946813909067134 | -0.981 | -2.891 | -8.52 |  |  |
| 2.953097094374314 | -0.982 | -2.901 | -8.566 |  |  |
| 2.959380279681493 | -0.983 | -2.91 | -8.613 |  |  |
| 2.965663464988673 | -0.985 | -2.92 | -8.659 |  |  |
| 2.971946650295853 | -0.986 | -2.929 | -8.706 |  |  |
| 2.978229835603032 | -0.987 | -2.939 | -8.752 |  |  |
| 2.984513020910212 | -0.988 | -2.948 | -8.798 |  |  |
| 2.990796206217391 | -0.989 | -2.957 | -8.843 |  |  |
| 2.997079391524571 | -0.99 | -2.966 | -8.889 |  |  |
| 3.003362576831751 | -0.99 | -2.975 | -8.934 |  |  |
| 3.009645762138931 | -0.991 | -2.983 | -8.979 |  |  |
| 3.01592894744611 | -0.992 | -2.992 | -9.024 |  |  |
| 3.02221213275329 | -0.993 | -3.001 | -9.069 |  |  |
| 3.028495318060469 | -0.994 | -3.009 | -9.113 |  |  |
| 3.034778503367649 | -0.994 | -3.017 | -9.157 |  |  |
| 3.041061688674829 | -0.995 | -3.026 | -9.201 |  |  |
| 3.047344873982008 | -0.996 | -3.034 | -9.245 |  |  |
| 3.053628059289188 | -0.996 | -3.042 | -9.289 |  |  |
| 3.059911244596367 | -0.997 | -3.05 | -9.332 |  |  |
| 3.066194429903547 | -0.997 | -3.057 | -9.375 |  |  |
| 3.072477615210727 | -0.998 | -3.065 | -9.418 |  |  |
| 3.078760800517906 | -0.998 | -3.073 | -9.46 |  |  |
| 3.085043985825086 | -0.998 | -3.08 | -9.502 |  |  |
| 3.091327171132266 | -0.999 | -3.087 | -9.544 |  |  |
| 3.097610356439445 | -0.999 | -3.095 | -9.586 |  |  |
| 3.103893541746625 | -0.999 | -3.102 | -9.627 |  |  |
| 3.110176727053805 | -1 | -3.109 | -9.668 |  |  |
| 3.116459912360984 | -1 | -3.115 | -9.709 |  |  |
| 3.122743097668164 | -1 | -3.122 | -9.75 |  |  |
| 3.129026282975343 | -1 | -3.129 | -9.79 |  |  |
| 3.135309468282523 | -1 | -3.135 | -9.83 |  |  |
| 3.141592653589703 | -1 | -3.142 | -9.87 |  |  |
| 3.147875838896883 | -1 | -3.148 | -9.909 |  |  |
| 3.154159024204062 | -1 | -3.154 | -9.948 |  |  |
| 3.160442209511242 | -1 | -3.16 | -9.987 |  |  |
| 3.166725394818422 | -1 | -3.166 | -10.025 |  |  |
| 3.173008580125601 | -1 | -3.171 | -10.063 |  |  |
| 3.179291765432781 | -0.999 | -3.177 | -10.101 |  |  |
| 3.18557495073996 | -0.999 | -3.182 | -10.138 |  |  |
| 3.19185813604714 | -0.999 | -3.188 | -10.175 |  |  |
| 3.19814132135432 | -0.998 | -3.193 | -10.212 |  |  |
| 3.2044245066615 | -0.998 | -3.198 | -10.248 |  |  |
| 3.210707691968679 | -0.998 | -3.203 | -10.284 |  |  |
| 3.216990877275859 | -0.997 | -3.208 | -10.32 |  |  |
| 3.223274062583038 | -0.997 | -3.213 | -10.355 |  |  |
| 3.229557247890217 | -0.996 | -3.217 | -10.39 |  |  |
| 3.235840433197398 | -0.996 | -3.221 | -10.424 |  |  |
| 3.242123618504577 | -0.995 | -3.226 | -10.458 |  |  |
| 3.248406803811757 | -0.994 | -3.23 | -10.492 |  |  |
| 3.254689989118936 | -0.994 | -3.234 | -10.525 |  |  |
| 3.260973174426116 | -0.993 | -3.238 | -10.558 |  |  |
| 3.267256359733296 | -0.992 | -3.241 | -10.591 |  |  |
| 3.273539545040475 | -0.991 | -3.245 | -10.623 |  |  |
| 3.279822730347655 | -0.99 | -3.249 | -10.655 |  |  |
| 3.286105915654835 | -0.99 | -3.252 | -10.686 |  |  |
| 3.292389100962014 | -0.989 | -3.255 | -10.717 |  |  |
| 3.298672286269194 | -0.988 | -3.258 | -10.747 |  |  |
| 3.304955471576374 | -0.987 | -3.261 | -10.777 |  |  |
| 3.311238656883553 | -0.986 | -3.264 | -10.807 |  |  |
| 3.317521842190732 | -0.985 | -3.266 | -10.836 |  |  |
| 3.323805027497912 | -0.983 | -3.269 | -10.865 |  |  |
| 3.330088212805092 | -0.982 | -3.271 | -10.893 |  |  |
| 3.336371398112272 | -0.981 | -3.273 | -10.921 |  |  |
| 3.342654583419451 | -0.98 | -3.275 | -10.948 |  |  |
| 3.34893776872663 | -0.979 | -3.277 | -10.975 |  |  |
| 3.355220954033811 | -0.977 | -3.279 | -11.002 |  |  |
| 3.36150413934099 | -0.976 | -3.281 | -11.028 |  |  |
| 3.36778732464817 | -0.975 | -3.282 | -11.053 |  |  |
| 3.37407050995535 | -0.973 | -3.283 | -11.078 |  |  |
| 3.380353695262529 | -0.972 | -3.284 | -11.103 |  |  |
| 3.386636880569709 | -0.97 | -3.285 | -11.127 |  |  |
| 3.392920065876888 | -0.969 | -3.286 | -11.15 |  |  |
| 3.399203251184068 | -0.967 | -3.287 | -11.173 |  |  |
| 3.405486436491248 | -0.965 | -3.288 | -11.196 |  |  |
| 3.411769621798427 | -0.964 | -3.288 | -11.218 |  |  |
| 3.418052807105607 | -0.962 | -3.288 | -11.239 |  |  |
| 3.424335992412787 | -0.96 | -3.288 | -11.26 |  |  |
| 3.430619177719966 | -0.959 | -3.288 | -11.281 |  |  |
| 3.436902363027146 | -0.957 | -3.288 | -11.301 |  |  |
| 3.443185548334325 | -0.955 | -3.288 | -11.32 |  |  |
| 3.449468733641505 | -0.953 | -3.287 | -11.339 |  |  |
| 3.455751918948685 | -0.951 | -3.287 | -11.358 |  |  |
| 3.462035104255865 | -0.949 | -3.286 | -11.376 |  |  |
| 3.468318289563044 | -0.947 | -3.285 | -11.393 |  |  |
| 3.474601474870224 | -0.945 | -3.284 | -11.41 |  |  |
| 3.480884660177403 | -0.943 | -3.282 | -11.426 |  |  |
| 3.487167845484583 | -0.941 | -3.281 | -11.441 |  |  |
| 3.493451030791763 | -0.939 | -3.279 | -11.456 |  |  |
| 3.499734216098942 | -0.937 | -3.278 | -11.471 |  |  |
| 3.506017401406122 | -0.934 | -3.276 | -11.485 |  |  |
| 3.512300586713302 | -0.932 | -3.274 | -11.498 |  |  |
| 3.518583772020481 | -0.93 | -3.271 | -11.511 |  |  |
| 3.524866957327661 | -0.927 | -3.269 | -11.523 |  |  |
| 3.531150142634841 | -0.925 | -3.267 | -11.535 |  |  |
| 3.53743332794202 | -0.923 | -3.264 | -11.546 |  |  |
| 3.5437165132492 | -0.92 | -3.261 | -11.556 |  |  |
| 3.54999969855638 | -0.918 | -3.258 | -11.566 |  |  |
| 3.556282883863559 | -0.915 | -3.255 | -11.575 |  |  |
| 3.562566069170739 | -0.913 | -3.252 | -11.584 |  |  |
| 3.568849254477918 | -0.91 | -3.248 | -11.592 |  |  |
| 3.575132439785098 | -0.907 | -3.244 | -11.599 |  |  |
| 3.581415625092278 | -0.905 | -3.241 | -11.606 |  |  |
| 3.587698810399457 | -0.902 | -3.237 | -11.612 |  |  |
| 3.593981995706637 | -0.899 | -3.232 | -11.617 |  |  |
| 3.600265181013817 | -0.897 | -3.228 | -11.622 |  |  |
| 3.606548366320996 | -0.894 | -3.224 | -11.626 |  |  |
| 3.612831551628176 | -0.891 | -3.219 | -11.63 |  |  |
| 3.619114736935355 | -0.888 | -3.214 | -11.633 |  |  |
| 3.625397922242535 | -0.885 | -3.209 | -11.635 |  |  |
| 3.631681107549715 | -0.882 | -3.204 | -11.637 |  |  |
| 3.637964292856894 | -0.879 | -3.199 | -11.638 |  |  |
| 3.644247478164074 | -0.876 | -3.193 | -11.638 |  |  |
| 3.650530663471254 | -0.873 | -3.188 | -11.637 |  |  |
| 3.656813848778433 | -0.87 | -3.182 | -11.636 |  |  |
| 3.663097034085613 | -0.867 | -3.176 | -11.635 |  |  |
| 3.669380219392792 | -0.864 | -3.17 | -11.632 |  |  |
| 3.675663404699972 | -0.861 | -3.164 | -11.629 |  |  |
| 3.681946590007152 | -0.858 | -3.157 | -11.625 |  |  |
| 3.688229775314331 | -0.854 | -3.151 | -11.621 |  |  |
| 3.694512960621511 | -0.851 | -3.144 | -11.616 |  |  |
| 3.700796145928691 | -0.848 | -3.137 | -11.61 |  |  |
| 3.70707933123587 | -0.844 | -3.13 | -11.603 |  |  |
| 3.71336251654305 | -0.841 | -3.123 | -11.596 |  |  |
| 3.71964570185023 | -0.838 | -3.115 | -11.588 |  |  |
| 3.72592888715741 | -0.834 | -3.108 | -11.579 |  |  |
| 3.732212072464589 | -0.831 | -3.1 | -11.57 |  |  |
| 3.738495257771769 | -0.827 | -3.092 | -11.56 |  |  |
| 3.744778443078948 | -0.824 | -3.084 | -11.549 |  |  |
| 3.751061628386128 | -0.82 | -3.076 | -11.537 |  |  |
| 3.757344813693308 | -0.816 | -3.067 | -11.525 |  |  |
| 3.763627999000487 | -0.813 | -3.059 | -11.512 |  |  |
| 3.769911184307667 | -0.809 | -3.05 | -11.498 |  |  |
| 3.776194369614846 | -0.805 | -3.041 | -11.483 |  |  |
| 3.782477554922026 | -0.802 | -3.032 | -11.468 |  |  |
| 3.788760740229206 | -0.798 | -3.023 | -11.452 |  |  |
| 3.795043925536385 | -0.794 | -3.013 | -11.435 |  |  |
| 3.801327110843565 | -0.79 | -3.004 | -11.418 |  |  |
| 3.807610296150745 | -0.786 | -2.994 | -11.4 |  |  |
| 3.813893481457924 | -0.782 | -2.984 | -11.38 |  |  |
| 3.820176666765104 | -0.778 | -2.974 | -11.361 |  |  |
| 3.826459852072284 | -0.775 | -2.964 | -11.34 |  |  |
| 3.832743037379463 | -0.771 | -2.953 | -11.319 |  |  |
| 3.839026222686643 | -0.766 | -2.943 | -11.297 |  |  |
| 3.845309407993823 | -0.762 | -2.932 | -11.274 |  |  |
| 3.851592593301002 | -0.758 | -2.921 | -11.25 |  |  |
| 3.857875778608182 | -0.754 | -2.91 | -11.226 |  |  |
| 3.864158963915361 | -0.75 | -2.899 | -11.2 |  |  |
| 3.870442149222541 | -0.746 | -2.887 | -11.174 |  |  |
| 3.876725334529721 | -0.742 | -2.876 | -11.148 |  |  |
| 3.8830085198369 | -0.738 | -2.864 | -11.12 |  |  |
| 3.88929170514408 | -0.733 | -2.852 | -11.092 |  |  |
| 3.89557489045126 | -0.729 | -2.84 | -11.062 |  |  |
| 3.901858075758439 | -0.725 | -2.827 | -11.032 |  |  |
| 3.908141261065619 | -0.72 | -2.815 | -11.002 |  |  |
| 3.914424446372799 | -0.716 | -2.802 | -10.97 |  |  |
| 3.920707631679978 | -0.712 | -2.79 | -10.938 |  |  |
| 3.926990816987158 | -0.707 | -2.777 | -10.904 |  |  |
| 3.933274002294337 | -0.703 | -2.764 | -10.87 |  |  |
| 3.939557187601517 | -0.698 | -2.75 | -10.836 |  |  |
| 3.945840372908697 | -0.694 | -2.737 | -10.8 |  |  |
| 3.952123558215876 | -0.689 | -2.723 | -10.763 |  |  |
| 3.958406743523056 | -0.685 | -2.71 | -10.726 |  |  |
| 3.964689928830236 | -0.68 | -2.696 | -10.688 |  |  |
| 3.970973114137415 | -0.675 | -2.682 | -10.649 |  |  |
| 3.977256299444595 | -0.671 | -2.667 | -10.609 |  |  |
| 3.983539484751775 | -0.666 | -2.653 | -10.569 |  |  |
| 3.989822670058954 | -0.661 | -2.639 | -10.527 |  |  |
| 3.996105855366134 | -0.657 | -2.624 | -10.485 |  |  |
| 4.002389040673314 | -0.652 | -2.609 | -10.442 |  |  |
| 4.008672225980493 | -0.647 | -2.594 | -10.398 |  |  |
| 4.014955411287672 | -0.642 | -2.579 | -10.353 |  |  |
| 4.021238596594851 | -0.637 | -2.563 | -10.307 |  |  |
| 4.02752178190203 | -0.633 | -2.548 | -10.261 |  |  |
| 4.03380496720921 | -0.628 | -2.532 | -10.214 |  |  |
| 4.040088152516389 | -0.623 | -2.516 | -10.165 |  |  |
| 4.046371337823567 | -0.618 | -2.5 | -10.116 |  |  |
| 4.052654523130747 | -0.613 | -2.484 | -10.066 |  |  |
| 4.058937708437926 | -0.608 | -2.468 | -10.016 |  |  |
| 4.065220893745105 | -0.603 | -2.451 | -9.964 |  |  |
| 4.071504079052285 | -0.598 | -2.434 | -9.912 |  |  |
| 4.077787264359464 | -0.593 | -2.418 | -9.858 |  |  |
| 4.084070449666643 | -0.588 | -2.401 | -9.804 |  |  |
| 4.090353634973822 | -0.583 | -2.383 | -9.749 |  |  |
| 4.096636820281001 | -0.578 | -2.366 | -9.693 |  |  |
| 4.102920005588181 | -0.572 | -2.349 | -9.636 |  |  |
| 4.10920319089536 | -0.567 | -2.331 | -9.579 |  |  |
| 4.115486376202539 | -0.562 | -2.313 | -9.52 |  |  |
| 4.121769561509718 | -0.557 | -2.295 | -9.461 |  |  |
| 4.128052746816897 | -0.552 | -2.277 | -9.4 |  |  |
| 4.134335932124077 | -0.546 | -2.259 | -9.339 |  |  |
| 4.140619117431256 | -0.541 | -2.241 | -9.277 |  |  |
| 4.146902302738435 | -0.536 | -2.222 | -9.215 |  |  |
| 4.153185488045614 | -0.531 | -2.203 | -9.151 |  |  |
| 4.159468673352793 | -0.525 | -2.184 | -9.086 |  |  |
| 4.165751858659973 | -0.52 | -2.165 | -9.021 |  |  |
| 4.172035043967152 | -0.514 | -2.146 | -8.954 |  |  |
| 4.178318229274331 | -0.509 | -2.127 | -8.887 |  |  |
| 4.18460141458151 | -0.504 | -2.107 | -8.819 |  |  |
| 4.190884599888689 | -0.498 | -2.088 | -8.75 |  |  |
| 4.197167785195868 | -0.493 | -2.068 | -8.68 |  |  |
| 4.203450970503048 | -0.487 | -2.048 | -8.609 |  |  |
| 4.209734155810227 | -0.482 | -2.028 | -8.538 |  |  |
| 4.216017341117406 | -0.476 | -2.008 | -8.465 |  |  |
| 4.222300526424585 | -0.471 | -1.987 | -8.392 |  |  |
| 4.228583711731764 | -0.465 | -1.967 | -8.317 |  |  |
| 4.234866897038944 | -0.46 | -1.946 | -8.242 |  |  |
| 4.241150082346122 | -0.454 | -1.925 | -8.166 |  |  |
| 4.247433267653302 | -0.448 | -1.904 | -8.089 |  |  |
| 4.253716452960481 | -0.443 | -1.883 | -8.011 |  |  |
| 4.25999963826766 | -0.437 | -1.862 | -7.933 |  |  |
| 4.26628282357484 | -0.431 | -1.841 | -7.853 |  |  |
| 4.272566008882019 | -0.426 | -1.819 | -7.773 |  |  |
| 4.278849194189198 | -0.42 | -1.797 | -7.691 |  |  |
| 4.285132379496377 | -0.414 | -1.776 | -7.609 |  |  |
| 4.291415564803557 | -0.409 | -1.754 | -7.526 |  |  |
| 4.297698750110735 | -0.403 | -1.732 | -7.442 |  |  |
| 4.303981935417915 | -0.397 | -1.709 | -7.357 |  |  |
| 4.310265120725094 | -0.391 | -1.687 | -7.271 |  |  |
| 4.316548306032273 | -0.386 | -1.664 | -7.184 |  |  |
| 4.322831491339452 | -0.38 | -1.642 | -7.097 |  |  |
| 4.329114676646632 | -0.374 | -1.619 | -7.008 |  |  |
| 4.335397861953811 | -0.368 | -1.596 | -6.919 |  |  |
| 4.34168104726099 | -0.362 | -1.573 | -6.829 |  |  |
| 4.347964232568169 | -0.356 | -1.55 | -6.738 |  |  |
| 4.354247417875348 | -0.351 | -1.526 | -6.646 |  |  |
| 4.360530603182528 | -0.345 | -1.503 | -6.553 |  |  |
| 4.366813788489707 | -0.339 | -1.479 | -6.459 |  |  |
| 4.373096973796886 | -0.333 | -1.455 | -6.365 |  |  |
| 4.379380159104065 | -0.327 | -1.432 | -6.269 |  |  |
| 4.385663344411244 | -0.321 | -1.408 | -6.173 |  |  |
| 4.391946529718424 | -0.315 | -1.383 | -6.076 |  |  |
| 4.398229715025602 | -0.309 | -1.359 | -5.978 |  |  |
| 4.404512900332782 | -0.303 | -1.335 | -5.879 |  |  |
| 4.41079608563996 | -0.297 | -1.31 | -5.779 |  |  |
| 4.41707927094714 | -0.291 | -1.286 | -5.678 |  |  |
| 4.42336245625432 | -0.285 | -1.261 | -5.577 |  |  |
| 4.429645641561499 | -0.279 | -1.236 | -5.474 |  |  |
| 4.435928826868678 | -0.273 | -1.211 | -5.371 |  |  |
| 4.442212012175857 | -0.267 | -1.186 | -5.267 |  |  |
| 4.448495197483036 | -0.261 | -1.16 | -5.162 |  |  |
| 4.454778382790215 | -0.255 | -1.135 | -5.056 |  |  |
| 4.461061568097395 | -0.249 | -1.109 | -4.949 |  |  |
| 4.467344753404574 | -0.243 | -1.084 | -4.842 |  |  |
| 4.473627938711753 | -0.236 | -1.058 | -4.733 |  |  |
| 4.479911124018932 | -0.23 | -1.032 | -4.624 |  |  |
| 4.486194309326112 | -0.224 | -1.006 | -4.514 |  |  |
| 4.49247749463329 | -0.218 | -0.98 | -4.403 |  |  |
| 4.49876067994047 | -0.212 | -0.954 | -4.291 |  |  |
| 4.50504386524765 | -0.206 | -0.927 | -4.178 |  |  |
| 4.511327050554828 | -0.2 | -0.901 | -4.065 |  |  |
| 4.517610235862008 | -0.194 | -0.874 | -3.95 |  |  |
| 4.523893421169186 | -0.187 | -0.848 | -3.835 |  |  |
| 4.530176606476366 | -0.181 | -0.821 | -3.719 |  |  |
| 4.536459791783545 | -0.175 | -0.794 | -3.602 |  |  |
| 4.542742977090724 | -0.169 | -0.767 | -3.484 |  |  |
| 4.549026162397904 | -0.163 | -0.74 | -3.366 |  |  |
| 4.555309347705083 | -0.156 | -0.713 | -3.246 |  |  |
| 4.561592533012262 | -0.15 | -0.685 | -3.126 |  |  |
| 4.567875718319441 | -0.144 | -0.658 | -3.005 |  |  |
| 4.57415890362662 | -0.138 | -0.63 | -2.883 |  |  |
| 4.5804420889338 | -0.132 | -0.603 | -2.76 |  |  |
| 4.586725274240979 | -0.125 | -0.575 | -2.637 |  |  |
| 4.593008459548158 | -0.119 | -0.547 | -2.512 |  |  |
| 4.599291644855337 | -0.113 | -0.519 | -2.387 |  |  |
| 4.605574830162516 | -0.107 | -0.491 | -2.261 |  |  |
| 4.611858015469695 | -0.1 | -0.463 | -2.135 |  |  |
| 4.618141200776875 | -0.094 | -0.435 | -2.007 |  |  |
| 4.624424386084054 | -0.088 | -0.406 | -1.879 |  |  |
| 4.630707571391233 | -0.082 | -0.378 | -1.75 |  |  |
| 4.636990756698412 | -0.075 | -0.349 | -1.62 |  |  |
| 4.643273942005591 | -0.069 | -0.321 | -1.489 |  |  |
| 4.649557127312771 | -0.063 | -0.292 | -1.357 |  |  |
| 4.65584031261995 | -0.057 | -0.263 | -1.225 |  |  |
| 4.66212349792713 | -0.05 | -0.234 | -1.092 |  |  |
| 4.668406683234308 | -0.044 | -0.205 | -0.958 |  |  |
| 4.674689868541487 | -0.038 | -0.176 | -0.824 |  |  |
| 4.680973053848666 | -0.031 | -0.147 | -0.688 |  |  |
| 4.687256239155846 | -0.025 | -0.118 | -0.552 |  |  |
| 4.693539424463024 | -0.019 | -0.088 | -0.415 |  |  |
| 4.699822609770204 | -0.013 | -0.059 | -0.278 |  |  |
| 4.706105795077383 | -0.006 | -0.03 | -0.139 |  |  |
| 4.712388980384562 | 0 | 0 | 0 |  |  |
| 4.718672165691741 | 0.006 | 0.03 | 0.14 |  |  |
| 4.724955350998921 | 0.013 | 0.059 | 0.281 |  |  |
| 4.7312385363061 | 0.019 | 0.089 | 0.422 |  |  |
| 4.73752172161328 | 0.025 | 0.119 | 0.564 |  |  |
| 4.743804906920459 | 0.031 | 0.149 | 0.707 |  |  |
| 4.750088092227637 | 0.038 | 0.179 | 0.85 |  |  |
| 4.756371277534817 | 0.044 | 0.209 | 0.995 |  |  |
| 4.762654462841996 | 0.05 | 0.239 | 1.14 |  |  |
| 4.768937648149175 | 0.057 | 0.27 | 1.285 |  |  |
| 4.775220833456354 | 0.063 | 0.3 | 1.432 |  |  |
| 4.781504018763534 | 0.069 | 0.33 | 1.579 |  |  |
| 4.787787204070713 | 0.075 | 0.361 | 1.727 |  |  |
| 4.794070389377892 | 0.082 | 0.391 | 1.875 |  |  |
| 4.800353574685071 | 0.088 | 0.422 | 2.024 |  |  |
| 4.806636759992251 | 0.094 | 0.452 | 2.174 |  |  |
| 4.81291994529943 | 0.1 | 0.483 | 2.325 |  |  |
| 4.819203130606608 | 0.107 | 0.514 | 2.476 |  |  |
| 4.825486315913788 | 0.113 | 0.545 | 2.628 |  |  |
| 4.831769501220967 | 0.119 | 0.575 | 2.78 |  |  |
| 4.838052686528146 | 0.125 | 0.606 | 2.934 |  |  |
| 4.844335871835326 | 0.132 | 0.637 | 3.087 |  |  |
| 4.850619057142505 | 0.138 | 0.668 | 3.242 |  |  |
| 4.856902242449684 | 0.144 | 0.699 | 3.397 |  |  |
| 4.863185427756863 | 0.15 | 0.731 | 3.553 |  |  |
| 4.869468613064042 | 0.156 | 0.762 | 3.709 |  |  |
| 4.875751798371221 | 0.163 | 0.793 | 3.866 |  |  |
| 4.882034983678401 | 0.169 | 0.824 | 4.024 |  |  |
| 4.88831816898558 | 0.175 | 0.856 | 4.182 |  |  |
| 4.894601354292759 | 0.181 | 0.887 | 4.341 |  |  |
| 4.900884539599939 | 0.187 | 0.918 | 4.501 |  |  |
| 4.907167724907117 | 0.194 | 0.95 | 4.661 |  |  |
| 4.913450910214297 | 0.2 | 0.981 | 4.821 |  |  |
| 4.919734095521476 | 0.206 | 1.013 | 4.983 |  |  |
| 4.926017280828655 | 0.212 | 1.044 | 5.144 |  |  |
| 4.932300466135834 | 0.218 | 1.076 | 5.307 |  |  |
| 4.938583651443014 | 0.224 | 1.108 | 5.47 |  |  |
| 4.944866836750193 | 0.23 | 1.139 | 5.633 |  |  |
| 4.951150022057372 | 0.236 | 1.171 | 5.798 |  |  |
| 4.957433207364551 | 0.243 | 1.203 | 5.962 |  |  |
| 4.96371639267173 | 0.249 | 1.234 | 6.127 |  |  |
| 4.96999957797891 | 0.255 | 1.266 | 6.293 |  |  |
| 4.976282763286088 | 0.261 | 1.298 | 6.459 |  |  |
| 4.982565948593268 | 0.267 | 1.33 | 6.626 |  |  |
| 4.988849133900447 | 0.273 | 1.362 | 6.793 |  |  |
| 4.995132319207626 | 0.279 | 1.394 | 6.961 |  |  |
| 5.001415504514805 | 0.285 | 1.425 | 7.13 |  |  |
| 5.007698689821984 | 0.291 | 1.457 | 7.298 |  |  |
| 5.013981875129164 | 0.297 | 1.489 | 7.468 |  |  |
| 5.020265060436343 | 0.303 | 1.521 | 7.637 |  |  |
| 5.026548245743522 | 0.309 | 1.553 | 7.808 |  |  |
| 5.032831431050702 | 0.315 | 1.585 | 7.978 |  |  |
| 5.039114616357881 | 0.321 | 1.617 | 8.15 |  |  |
| 5.04539780166506 | 0.327 | 1.649 | 8.321 |  |  |
| 5.05168098697224 | 0.333 | 1.681 | 8.493 |  |  |
| 5.057964172279418 | 0.339 | 1.713 | 8.666 |  |  |
| 5.064247357586598 | 0.345 | 1.745 | 8.839 |  |  |
| 5.070530542893777 | 0.351 | 1.777 | 9.012 |  |  |
| 5.076813728200956 | 0.356 | 1.809 | 9.186 |  |  |
| 5.083096913508135 | 0.362 | 1.841 | 9.36 |  |  |
| 5.089380098815314 | 0.368 | 1.874 | 9.535 |  |  |
| 5.095663284122493 | 0.374 | 1.906 | 9.71 |  |  |
| 5.101946469429673 | 0.38 | 1.938 | 9.886 |  |  |
| 5.108229654736852 | 0.386 | 1.97 | 10.061 |  |  |
| 5.114512840044031 | 0.391 | 2.002 | 10.238 |  |  |
| 5.12079602535121 | 0.397 | 2.034 | 10.414 |  |  |
| 5.12707921065839 | 0.403 | 2.066 | 10.591 |  |  |
| 5.133362395965568 | 0.409 | 2.098 | 10.768 |  |  |
| 5.139645581272747 | 0.414 | 2.13 | 10.946 |  |  |
| 5.145928766579927 | 0.42 | 2.162 | 11.124 |  |  |
| 5.152211951887106 | 0.426 | 2.194 | 11.302 |  |  |
| 5.158495137194286 | 0.431 | 2.226 | 11.481 |  |  |
| 5.164778322501465 | 0.437 | 2.258 | 11.66 |  |  |
| 5.171061507808644 | 0.443 | 2.29 | 11.839 |  |  |
| 5.177344693115823 | 0.448 | 2.321 | 12.019 |  |  |
| 5.183627878423002 | 0.454 | 2.353 | 12.199 |  |  |
| 5.189911063730181 | 0.46 | 2.385 | 12.379 |  |  |
| 5.196194249037361 | 0.465 | 2.417 | 12.559 |  |  |
| 5.20247743434454 | 0.471 | 2.449 | 12.74 |  |  |
| 5.20876061965172 | 0.476 | 2.481 | 12.921 |  |  |
| 5.215043804958898 | 0.482 | 2.512 | 13.102 |  |  |
| 5.221326990266077 | 0.487 | 2.544 | 13.284 |  |  |
| 5.227610175573257 | 0.493 | 2.576 | 13.465 |  |  |
| 5.233893360880435 | 0.498 | 2.607 | 13.647 |  |  |
| 5.240176546187615 | 0.504 | 2.639 | 13.829 |  |  |
| 5.246459731494794 | 0.509 | 2.671 | 14.012 |  |  |
| 5.252742916801973 | 0.514 | 2.702 | 14.194 |  |  |
| 5.259026102109152 | 0.52 | 2.734 | 14.377 |  |  |
| 5.265309287416332 | 0.525 | 2.765 | 14.56 |  |  |
| 5.27159247272351 | 0.531 | 2.797 | 14.743 |  |  |
| 5.27787565803069 | 0.536 | 2.828 | 14.926 |  |  |
| 5.284158843337869 | 0.541 | 2.859 | 15.109 |  |  |
| 5.290442028645049 | 0.546 | 2.891 | 15.293 |  |  |
| 5.296725213952227 | 0.552 | 2.922 | 15.477 |  |  |
| 5.303008399259407 | 0.557 | 2.953 | 15.66 |  |  |
| 5.309291584566586 | 0.562 | 2.984 | 15.844 |  |  |
| 5.315574769873765 | 0.567 | 3.015 | 16.028 |  |  |
| 5.321857955180945 | 0.572 | 3.046 | 16.213 |  |  |
| 5.328141140488124 | 0.578 | 3.077 | 16.397 |  |  |
| 5.334424325795303 | 0.583 | 3.108 | 16.581 |  |  |
| 5.340707511102482 | 0.588 | 3.139 | 16.765 |  |  |
| 5.346990696409661 | 0.593 | 3.17 | 16.95 |  |  |
| 5.35327388171684 | 0.598 | 3.201 | 17.134 |  |  |
| 5.35955706702402 | 0.603 | 3.231 | 17.319 |  |  |
| 5.365840252331199 | 0.608 | 3.262 | 17.504 |  |  |
| 5.372123437638378 | 0.613 | 3.293 | 17.688 |  |  |
| 5.378406622945557 | 0.618 | 3.323 | 17.873 |  |  |
| 5.384689808252737 | 0.623 | 3.354 | 18.058 |  |  |
| 5.390972993559916 | 0.628 | 3.384 | 18.242 |  |  |
| 5.397256178867095 | 0.633 | 3.414 | 18.427 |  |  |
| 5.403539364174274 | 0.637 | 3.444 | 18.612 |  |  |
| 5.409822549481453 | 0.642 | 3.474 | 18.796 |  |  |
| 5.416105734788632 | 0.647 | 3.505 | 18.981 |  |  |
| 5.422388920095812 | 0.652 | 3.534 | 19.165 |  |  |
| 5.42867210540299 | 0.657 | 3.564 | 19.35 |  |  |
| 5.43495529071017 | 0.661 | 3.594 | 19.534 |  |  |
| 5.44123847601735 | 0.666 | 3.624 | 19.719 |  |  |
| 5.447521661324528 | 0.671 | 3.654 | 19.903 |  |  |
| 5.453804846631708 | 0.675 | 3.683 | 20.087 |  |  |
| 5.460088031938887 | 0.68 | 3.713 | 20.271 |  |  |
| 5.466371217246066 | 0.685 | 3.742 | 20.455 |  |  |
| 5.472654402553245 | 0.689 | 3.771 | 20.639 |  |  |
| 5.478937587860424 | 0.694 | 3.8 | 20.823 |  |  |
| 5.485220773167603 | 0.698 | 3.83 | 21.006 |  |  |
| 5.491503958474783 | 0.703 | 3.859 | 21.19 |  |  |
| 5.497787143781962 | 0.707 | 3.888 | 21.373 |  |  |
| 5.504070329089141 | 0.712 | 3.916 | 21.556 |  |  |
| 5.51035351439632 | 0.716 | 3.945 | 21.739 |  |  |
| 5.5166366997035 | 0.72 | 3.974 | 21.921 |  |  |
| 5.522919885010679 | 0.725 | 4.002 | 22.104 |  |  |
| 5.529203070317858 | 0.729 | 4.031 | 22.286 |  |  |
| 5.535486255625037 | 0.733 | 4.059 | 22.468 |  |  |
| 5.541769440932216 | 0.738 | 4.087 | 22.65 |  |  |
| 5.548052626239396 | 0.742 | 4.115 | 22.831 |  |  |
| 5.554335811546575 | 0.746 | 4.143 | 23.013 |  |  |
| 5.560618996853754 | 0.75 | 4.171 | 23.194 |  |  |
| 5.566902182160933 | 0.754 | 4.199 | 23.375 |  |  |
| 5.573185367468112 | 0.758 | 4.226 | 23.555 |  |  |
| 5.579468552775292 | 0.762 | 4.254 | 23.735 |  |  |
| 5.585751738082471 | 0.766 | 4.281 | 23.915 |  |  |
| 5.59203492338965 | 0.771 | 4.309 | 24.095 |  |  |
| 5.59831810869683 | 0.775 | 4.336 | 24.274 |  |  |
| 5.604601294004008 | 0.778 | 4.363 | 24.453 |  |  |
| 5.610884479311188 | 0.782 | 4.39 | 24.631 |  |  |
| 5.617167664618367 | 0.786 | 4.417 | 24.809 |  |  |
| 5.623450849925546 | 0.79 | 4.443 | 24.987 |  |  |
| 5.629734035232725 | 0.794 | 4.47 | 25.165 |  |  |
| 5.636017220539904 | 0.798 | 4.496 | 25.342 |  |  |
| 5.642300405847083 | 0.802 | 4.523 | 25.518 |  |  |
| 5.648583591154263 | 0.805 | 4.549 | 25.695 |  |  |
| 5.654866776461442 | 0.809 | 4.575 | 25.87 |  |  |
| 5.661149961768621 | 0.813 | 4.601 | 26.046 |  |  |
| 5.6674331470758 | 0.816 | 4.627 | 26.221 |  |  |
| 5.673716332382979 | 0.82 | 4.652 | 26.395 |  |  |
| 5.679999517690159 | 0.824 | 4.678 | 26.569 |  |  |
| 5.686282702997337 | 0.827 | 4.703 | 26.743 |  |  |
| 5.692565888304517 | 0.831 | 4.728 | 26.916 |  |  |
| 5.698849073611696 | 0.834 | 4.753 | 27.088 |  |  |
| 5.705132258918875 | 0.838 | 4.778 | 27.26 |  |  |
| 5.711415444226055 | 0.841 | 4.803 | 27.432 |  |  |
| 5.717698629533234 | 0.844 | 4.828 | 27.603 |  |  |
| 5.723981814840413 | 0.848 | 4.852 | 27.773 |  |  |
| 5.730265000147592 | 0.851 | 4.876 | 27.943 |  |  |
| 5.73654818545477 | 0.854 | 4.901 | 28.113 |  |  |
| 5.742831370761951 | 0.858 | 4.925 | 28.281 |  |  |
| 5.74911455606913 | 0.861 | 4.949 | 28.45 |  |  |
| 5.75539774137631 | 0.864 | 4.972 | 28.617 |  |  |
| 5.761680926683488 | 0.867 | 4.996 | 28.784 |  |  |
| 5.767964111990667 | 0.87 | 5.019 | 28.951 |  |  |
| 5.774247297297846 | 0.873 | 5.042 | 29.116 |  |  |
| 5.780530482605025 | 0.876 | 5.066 | 29.281 |  |  |
| 5.786813667912205 | 0.879 | 5.088 | 29.446 |  |  |
| 5.793096853219384 | 0.882 | 5.111 | 29.61 |  |  |
| 5.799380038526563 | 0.885 | 5.134 | 29.773 |  |  |
| 5.805663223833742 | 0.888 | 5.156 | 29.935 |  |  |
| 5.811946409140922 | 0.891 | 5.178 | 30.097 |  |  |
| 5.8182295944481 | 0.894 | 5.201 | 30.258 |  |  |
| 5.82451277975528 | 0.897 | 5.222 | 30.419 |  |  |
| 5.830795965062459 | 0.899 | 5.244 | 30.578 |  |  |
| 5.837079150369638 | 0.902 | 5.266 | 30.737 |  |  |
| 5.843362335676817 | 0.905 | 5.287 | 30.895 |  |  |
| 5.849645520983997 | 0.907 | 5.308 | 31.053 |  |  |
| 5.855928706291176 | 0.91 | 5.33 | 31.209 |  |  |
| 5.862211891598355 | 0.913 | 5.35 | 31.365 |  |  |
| 5.868495076905535 | 0.915 | 5.371 | 31.52 |  |  |
| 5.874778262212714 | 0.918 | 5.392 | 31.674 |  |  |
| 5.881061447519893 | 0.92 | 5.412 | 31.828 |  |  |
| 5.887344632827072 | 0.923 | 5.432 | 31.981 |  |  |
| 5.893627818134251 | 0.925 | 5.452 | 32.132 |  |  |
| 5.899911003441431 | 0.927 | 5.472 | 32.283 |  |  |
| 5.90619418874861 | 0.93 | 5.491 | 32.434 |  |  |
| 5.912477374055789 | 0.932 | 5.511 | 32.583 |  |  |
| 5.918760559362968 | 0.934 | 5.53 | 32.731 |  |  |
| 5.925043744670147 | 0.937 | 5.549 | 32.879 |  |  |
| 5.931326929977326 | 0.939 | 5.568 | 33.025 |  |  |
| 5.937610115284505 | 0.941 | 5.587 | 33.171 |  |  |
| 5.943893300591684 | 0.943 | 5.605 | 33.316 |  |  |
| 5.950176485898864 | 0.945 | 5.623 | 33.46 |  |  |
| 5.956459671206043 | 0.947 | 5.641 | 33.602 |  |  |
| 5.962742856513223 | 0.949 | 5.659 | 33.744 |  |  |
| 5.969026041820402 | 0.951 | 5.677 | 33.885 |  |  |
| 5.975309227127581 | 0.953 | 5.694 | 34.025 |  |  |
| 5.98159241243476 | 0.955 | 5.712 | 34.165 |  |  |
| 5.987875597741939 | 0.957 | 5.729 | 34.303 |  |  |
| 5.994158783049118 | 0.959 | 5.746 | 34.44 |  |  |
| 6.000441968356298 | 0.96 | 5.762 | 34.576 |  |  |
| 6.006725153663476 | 0.962 | 5.779 | 34.711 |  |  |
| 6.013008338970656 | 0.964 | 5.795 | 34.845 |  |  |
| 6.019291524277835 | 0.965 | 5.811 | 34.978 |  |  |
| 6.025574709585015 | 0.967 | 5.827 | 35.109 |  |  |
| 6.031857894892193 | 0.969 | 5.842 | 35.24 |  |  |
| 6.038141080199372 | 0.97 | 5.858 | 35.37 |  |  |
| 6.044424265506552 | 0.972 | 5.873 | 35.499 |  |  |
| 6.050707450813731 | 0.973 | 5.888 | 35.626 |  |  |
| 6.05699063612091 | 0.975 | 5.903 | 35.753 |  |  |
| 6.06327382142809 | 0.976 | 5.917 | 35.878 |  |  |
| 6.069557006735269 | 0.977 | 5.932 | 36.002 |  |  |
| 6.075840192042448 | 0.979 | 5.946 | 36.125 |  |  |
| 6.082123377349627 | 0.98 | 5.96 | 36.247 |  |  |
| 6.088406562656806 | 0.981 | 5.973 | 36.368 |  |  |
| 6.094689747963986 | 0.982 | 5.987 | 36.487 |  |  |
| 6.100972933271164 | 0.983 | 6 | 36.606 |  |  |
| 6.107256118578344 | 0.985 | 6.013 | 36.723 |  |  |
| 6.113539303885523 | 0.986 | 6.026 | 36.839 |  |  |
| 6.119822489192702 | 0.987 | 6.038 | 36.954 |  |  |
| 6.126105674499882 | 0.988 | 6.051 | 37.067 |  |  |
| 6.132388859807061 | 0.989 | 6.063 | 37.179 |  |  |
| 6.13867204511424 | 0.99 | 6.075 | 37.29 |  |  |
| 6.144955230421419 | 0.99 | 6.086 | 37.4 |  |  |
| 6.151238415728598 | 0.991 | 6.098 | 37.509 |  |  |
| 6.157521601035778 | 0.992 | 6.109 | 37.616 |  |  |
| 6.163804786342957 | 0.993 | 6.12 | 37.722 |  |  |
| 6.170087971650136 | 0.994 | 6.131 | 37.827 |  |  |
| 6.176371156957315 | 0.994 | 6.141 | 37.93 |  |  |
| 6.182654342264494 | 0.995 | 6.151 | 38.032 |  |  |
| 6.188937527571674 | 0.996 | 6.161 | 38.133 |  |  |
| 6.195220712878853 | 0.996 | 6.171 | 38.232 |  |  |
| 6.201503898186032 | 0.997 | 6.181 | 38.33 |  |  |
| 6.207787083493211 | 0.997 | 6.19 | 38.427 |  |  |
| 6.21407026880039 | 0.998 | 6.199 | 38.522 |  |  |
| 6.22035345410757 | 0.998 | 6.208 | 38.616 |  |  |
| 6.226636639414749 | 0.998 | 6.217 | 38.709 |  |  |
| 6.232919824721928 | 0.999 | 6.225 | 38.8 |  |  |
| 6.239203010029107 | 0.999 | 6.233 | 38.89 |  |  |
| 6.245486195336286 | 0.999 | 6.241 | 38.978 |  |  |
| 6.251769380643465 | 1 | 6.249 | 39.065 |  |  |
| 6.258052565950644 | 1 | 6.256 | 39.151 |  |  |
| 6.264335751257824 | 1 | 6.263 | 39.235 |  |  |
| 6.270618936565003 | 1 | 6.27 | 39.318 |  |  |
| 6.276902121872182 | 1 | 6.277 | 39.399 |  |  |
| 6.283185307179361 | 1 | 6.283 | 39.478 |  |  |